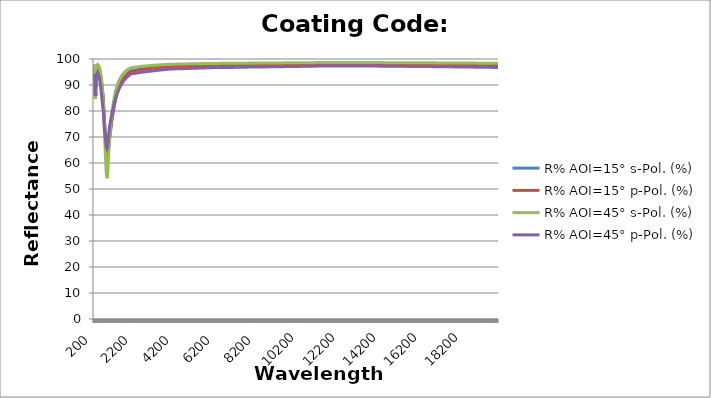
| Category | R% AOI=15° s-Pol. (%) | R% AOI=15° p-Pol. (%) | R% AOI=45° s-Pol. (%) | R% AOI=45° p-Pol. (%) |
|---|---|---|---|---|
| 200.0 | 96.196 | 95.695 | 97.964 | 94.34 |
| 210.0 | 96.264 | 95.821 | 97.534 | 93.773 |
| 220.0 | 95.829 | 95.392 | 96.652 | 92.587 |
| 230.0 | 94.94 | 94.49 | 95.05 | 90.907 |
| 240.0 | 93.361 | 92.903 | 92.083 | 88.772 |
| 250.0 | 90.886 | 90.485 | 87.526 | 86.776 |
| 260.0 | 86.806 | 86.65 | 84.808 | 85.833 |
| 270.0 | 84.898 | 84.804 | 89.276 | 87.025 |
| 280.0 | 87.232 | 86.816 | 93.231 | 89.119 |
| 290.0 | 90.482 | 89.896 | 95.323 | 90.965 |
| 300.0 | 92.911 | 92.334 | 96.475 | 92.358 |
| 310.0 | 94.393 | 93.874 | 97.102 | 93.277 |
| 320.0 | 95.338 | 94.875 | 97.481 | 93.9 |
| 330.0 | 95.946 | 95.529 | 97.712 | 94.307 |
| 340.0 | 96.342 | 95.958 | 97.853 | 94.567 |
| 350.0 | 96.577 | 96.215 | 97.918 | 94.69 |
| 360.0 | 96.728 | 96.38 | 97.944 | 94.744 |
| 370.0 | 96.817 | 96.48 | 97.939 | 94.738 |
| 380.0 | 96.858 | 96.527 | 97.908 | 94.68 |
| 390.0 | 96.836 | 96.504 | 97.838 | 94.538 |
| 400.0 | 96.784 | 96.449 | 97.748 | 94.36 |
| 410.0 | 96.715 | 96.377 | 97.648 | 94.168 |
| 420.0 | 96.623 | 96.28 | 97.53 | 93.948 |
| 430.0 | 96.51 | 96.159 | 97.392 | 93.7 |
| 440.0 | 96.344 | 95.982 | 97.212 | 93.371 |
| 450.0 | 96.111 | 95.732 | 96.973 | 92.934 |
| 460.0 | 95.873 | 95.478 | 96.727 | 92.501 |
| 470.0 | 95.616 | 95.203 | 96.457 | 92.048 |
| 480.0 | 95.338 | 94.907 | 96.162 | 91.574 |
| 490.0 | 95.046 | 94.598 | 95.849 | 91.096 |
| 500.0 | 94.685 | 94.215 | 95.467 | 90.517 |
| 510.0 | 94.291 | 93.798 | 95.048 | 89.906 |
| 520.0 | 93.871 | 93.355 | 94.591 | 89.278 |
| 530.0 | 93.422 | 92.885 | 94.095 | 88.634 |
| 540.0 | 92.944 | 92.386 | 93.556 | 87.979 |
| 550.0 | 92.404 | 91.824 | 92.941 | 87.264 |
| 560.0 | 91.783 | 91.178 | 92.225 | 86.464 |
| 570.0 | 91.127 | 90.502 | 91.452 | 85.662 |
| 580.0 | 90.436 | 89.793 | 90.618 | 84.863 |
| 590.0 | 89.71 | 89.052 | 89.719 | 84.071 |
| 600.0 | 88.948 | 88.282 | 88.755 | 83.29 |
| 610.0 | 88.146 | 87.474 | 87.711 | 82.519 |
| 620.0 | 87.309 | 86.639 | 86.598 | 81.769 |
| 630.0 | 86.44 | 85.779 | 85.416 | 81.044 |
| 640.0 | 85.543 | 84.898 | 84.168 | 80.348 |
| 650.0 | 84.62 | 83.999 | 82.859 | 79.686 |
| 660.0 | 83.246 | 82.637 | 81.052 | 78.472 |
| 670.0 | 81.808 | 81.222 | 79.142 | 77.259 |
| 680.0 | 80.313 | 79.759 | 77.138 | 76.052 |
| 690.0 | 78.767 | 78.255 | 75.053 | 74.856 |
| 700.0 | 77.177 | 76.716 | 72.904 | 73.674 |
| 710.0 | 75.745 | 75.351 | 70.93 | 72.738 |
| 720.0 | 74.303 | 73.983 | 68.953 | 71.833 |
| 730.0 | 72.859 | 72.62 | 66.996 | 70.962 |
| 740.0 | 71.424 | 71.272 | 65.084 | 70.126 |
| 750.0 | 70.006 | 69.947 | 63.238 | 69.326 |
| 760.0 | 68.618 | 68.654 | 61.486 | 68.564 |
| 770.0 | 67.265 | 67.398 | 59.84 | 67.838 |
| 780.0 | 65.957 | 66.186 | 58.32 | 67.151 |
| 790.0 | 64.701 | 65.024 | 56.937 | 66.501 |
| 800.0 | 63.503 | 63.917 | 55.702 | 65.888 |
| 810.0 | 62.805 | 63.3 | 55.107 | 65.712 |
| 820.0 | 62.173 | 62.742 | 54.654 | 65.564 |
| 830.0 | 61.608 | 62.243 | 54.34 | 65.441 |
| 840.0 | 61.111 | 61.805 | 54.159 | 65.343 |
| 850.0 | 60.682 | 61.425 | 54.103 | 65.268 |
| 860.0 | 61.326 | 62.1 | 55.333 | 66.17 |
| 870.0 | 62.033 | 62.827 | 56.66 | 67.068 |
| 880.0 | 62.796 | 63.598 | 58.062 | 67.959 |
| 890.0 | 63.608 | 64.407 | 59.518 | 68.84 |
| 900.0 | 64.462 | 65.249 | 61.009 | 69.709 |
| 910.0 | 65.336 | 66.103 | 62.489 | 70.553 |
| 920.0 | 66.234 | 66.975 | 63.97 | 71.381 |
| 930.0 | 67.151 | 67.859 | 65.438 | 72.193 |
| 940.0 | 68.08 | 68.75 | 66.885 | 72.986 |
| 950.0 | 69.015 | 69.645 | 68.3 | 73.762 |
| 960.0 | 69.62 | 70.213 | 69.315 | 74.231 |
| 970.0 | 70.237 | 70.791 | 70.312 | 74.696 |
| 980.0 | 70.861 | 71.375 | 71.288 | 75.155 |
| 990.0 | 71.49 | 71.963 | 72.239 | 75.609 |
| 1000.0 | 72.121 | 72.551 | 73.163 | 76.057 |
| 1010.0 | 72.751 | 73.139 | 74.059 | 76.498 |
| 1020.0 | 73.378 | 73.724 | 74.925 | 76.933 |
| 1030.0 | 73.999 | 74.304 | 75.761 | 77.36 |
| 1040.0 | 74.613 | 74.878 | 76.567 | 77.779 |
| 1050.0 | 75.219 | 75.445 | 77.342 | 78.191 |
| 1060.0 | 75.814 | 76.003 | 78.087 | 78.595 |
| 1070.0 | 76.399 | 76.552 | 78.803 | 78.991 |
| 1080.0 | 76.973 | 77.09 | 79.49 | 79.379 |
| 1090.0 | 77.534 | 77.618 | 80.148 | 79.759 |
| 1100.0 | 78.082 | 78.134 | 80.779 | 80.131 |
| 1110.0 | 78.617 | 78.639 | 81.384 | 80.495 |
| 1120.0 | 79.138 | 79.132 | 81.964 | 80.851 |
| 1130.0 | 79.646 | 79.613 | 82.519 | 81.199 |
| 1140.0 | 80.14 | 80.082 | 83.051 | 81.539 |
| 1150.0 | 80.62 | 80.539 | 83.56 | 81.871 |
| 1160.0 | 81.087 | 80.984 | 84.048 | 82.196 |
| 1170.0 | 81.54 | 81.416 | 84.515 | 82.513 |
| 1180.0 | 81.98 | 81.837 | 84.963 | 82.822 |
| 1190.0 | 82.407 | 82.246 | 85.392 | 83.125 |
| 1200.0 | 82.821 | 82.643 | 85.804 | 83.42 |
| 1210.0 | 83.223 | 83.029 | 86.198 | 83.709 |
| 1220.0 | 83.612 | 83.404 | 86.576 | 83.99 |
| 1230.0 | 83.989 | 83.768 | 86.939 | 84.265 |
| 1240.0 | 84.354 | 84.121 | 87.288 | 84.533 |
| 1250.0 | 84.709 | 84.464 | 87.622 | 84.795 |
| 1260.0 | 85.052 | 84.797 | 87.943 | 85.05 |
| 1270.0 | 85.384 | 85.12 | 88.252 | 85.3 |
| 1280.0 | 85.706 | 85.434 | 88.548 | 85.544 |
| 1290.0 | 86.019 | 85.738 | 88.833 | 85.781 |
| 1300.0 | 86.322 | 86.035 | 89.108 | 86.014 |
| 1310.0 | 86.616 | 86.322 | 89.373 | 86.242 |
| 1320.0 | 86.901 | 86.602 | 89.628 | 86.464 |
| 1330.0 | 87.177 | 86.872 | 89.873 | 86.68 |
| 1340.0 | 87.445 | 87.135 | 90.109 | 86.892 |
| 1350.0 | 87.704 | 87.391 | 90.337 | 87.098 |
| 1360.0 | 87.955 | 87.638 | 90.556 | 87.3 |
| 1370.0 | 88.199 | 87.879 | 90.768 | 87.497 |
| 1380.0 | 88.436 | 88.113 | 90.972 | 87.69 |
| 1390.0 | 88.665 | 88.34 | 91.169 | 87.878 |
| 1400.0 | 88.888 | 88.56 | 91.359 | 88.061 |
| 1410.0 | 89.104 | 88.774 | 91.543 | 88.241 |
| 1420.0 | 89.313 | 88.983 | 91.72 | 88.416 |
| 1430.0 | 89.516 | 89.185 | 91.892 | 88.588 |
| 1440.0 | 89.714 | 89.382 | 92.058 | 88.755 |
| 1450.0 | 89.906 | 89.573 | 92.218 | 88.919 |
| 1460.0 | 90.092 | 89.759 | 92.373 | 89.079 |
| 1470.0 | 90.273 | 89.94 | 92.523 | 89.236 |
| 1480.0 | 90.449 | 90.116 | 92.669 | 89.389 |
| 1490.0 | 90.62 | 90.287 | 92.81 | 89.539 |
| 1500.0 | 90.786 | 90.454 | 92.946 | 89.685 |
| 1510.0 | 90.947 | 90.615 | 93.078 | 89.828 |
| 1520.0 | 91.103 | 90.772 | 93.206 | 89.967 |
| 1530.0 | 91.255 | 90.925 | 93.33 | 90.104 |
| 1540.0 | 91.403 | 91.074 | 93.45 | 90.237 |
| 1550.0 | 91.547 | 91.219 | 93.566 | 90.368 |
| 1560.0 | 91.687 | 91.36 | 93.68 | 90.496 |
| 1570.0 | 91.824 | 91.498 | 93.79 | 90.622 |
| 1580.0 | 91.957 | 91.632 | 93.897 | 90.744 |
| 1590.0 | 92.086 | 91.763 | 94 | 90.865 |
| 1600.0 | 92.213 | 91.891 | 94.102 | 90.982 |
| 1610.0 | 92.336 | 92.016 | 94.2 | 91.098 |
| 1620.0 | 92.456 | 92.137 | 94.295 | 91.211 |
| 1630.0 | 92.573 | 92.256 | 94.388 | 91.322 |
| 1640.0 | 92.687 | 92.372 | 94.479 | 91.43 |
| 1650.0 | 92.798 | 92.485 | 94.567 | 91.537 |
| 1660.0 | 92.907 | 92.595 | 94.653 | 91.641 |
| 1670.0 | 93.012 | 92.703 | 94.736 | 91.744 |
| 1680.0 | 93.116 | 92.808 | 94.818 | 91.844 |
| 1690.0 | 93.217 | 92.911 | 94.897 | 91.942 |
| 1700.0 | 93.315 | 93.012 | 94.974 | 92.039 |
| 1710.0 | 93.412 | 93.11 | 95.05 | 92.134 |
| 1720.0 | 93.506 | 93.206 | 95.123 | 92.226 |
| 1730.0 | 93.597 | 93.299 | 95.195 | 92.318 |
| 1740.0 | 93.687 | 93.391 | 95.265 | 92.407 |
| 1750.0 | 93.775 | 93.481 | 95.333 | 92.495 |
| 1760.0 | 93.86 | 93.568 | 95.4 | 92.581 |
| 1770.0 | 93.944 | 93.654 | 95.465 | 92.665 |
| 1780.0 | 94.026 | 93.738 | 95.529 | 92.748 |
| 1790.0 | 94.106 | 93.82 | 95.591 | 92.83 |
| 1800.0 | 94.185 | 93.901 | 95.652 | 92.91 |
| 1810.0 | 94.261 | 93.979 | 95.711 | 92.988 |
| 1820.0 | 94.336 | 94.056 | 95.769 | 93.066 |
| 1830.0 | 94.41 | 94.132 | 95.825 | 93.142 |
| 1840.0 | 94.482 | 94.206 | 95.881 | 93.216 |
| 1850.0 | 94.552 | 94.278 | 95.935 | 93.289 |
| 1860.0 | 94.621 | 94.349 | 95.988 | 93.361 |
| 1870.0 | 94.688 | 94.418 | 96.04 | 93.432 |
| 1880.0 | 94.754 | 94.487 | 96.09 | 93.501 |
| 1890.0 | 94.819 | 94.553 | 96.14 | 93.57 |
| 1900.0 | 94.883 | 94.619 | 96.189 | 93.637 |
| 1910.0 | 94.945 | 94.683 | 96.236 | 93.702 |
| 1920.0 | 95.006 | 94.746 | 96.283 | 93.767 |
| 1930.0 | 95.065 | 94.807 | 96.328 | 93.831 |
| 1940.0 | 95.124 | 94.868 | 96.373 | 93.894 |
| 1950.0 | 95.181 | 94.927 | 96.417 | 93.956 |
| 1960.0 | 95.238 | 94.985 | 96.46 | 94.016 |
| 1970.0 | 95.293 | 95.042 | 96.502 | 94.076 |
| 1980.0 | 95.347 | 95.098 | 96.543 | 94.135 |
| 1990.0 | 95.4 | 95.153 | 96.584 | 94.193 |
| 2000.0 | 95.452 | 95.207 | 96.623 | 94.25 |
| 2010.0 | 95.469 | 95.224 | 96.636 | 94.262 |
| 2020.0 | 95.485 | 95.24 | 96.649 | 94.274 |
| 2030.0 | 95.501 | 95.256 | 96.662 | 94.287 |
| 2040.0 | 95.517 | 95.272 | 96.674 | 94.299 |
| 2050.0 | 95.533 | 95.288 | 96.687 | 94.312 |
| 2060.0 | 95.549 | 95.304 | 96.699 | 94.324 |
| 2070.0 | 95.565 | 95.32 | 96.711 | 94.336 |
| 2080.0 | 95.58 | 95.336 | 96.723 | 94.349 |
| 2090.0 | 95.596 | 95.351 | 96.735 | 94.361 |
| 2100.0 | 95.611 | 95.367 | 96.747 | 94.374 |
| 2110.0 | 95.626 | 95.382 | 96.759 | 94.386 |
| 2120.0 | 95.641 | 95.397 | 96.771 | 94.398 |
| 2130.0 | 95.656 | 95.412 | 96.782 | 94.41 |
| 2140.0 | 95.671 | 95.427 | 96.794 | 94.423 |
| 2150.0 | 95.686 | 95.442 | 96.805 | 94.435 |
| 2160.0 | 95.7 | 95.457 | 96.816 | 94.447 |
| 2170.0 | 95.715 | 95.471 | 96.827 | 94.46 |
| 2180.0 | 95.729 | 95.486 | 96.838 | 94.472 |
| 2190.0 | 95.743 | 95.5 | 96.849 | 94.484 |
| 2200.0 | 95.757 | 95.515 | 96.86 | 94.496 |
| 2210.0 | 95.771 | 95.529 | 96.871 | 94.508 |
| 2220.0 | 95.785 | 95.543 | 96.882 | 94.521 |
| 2230.0 | 95.799 | 95.557 | 96.892 | 94.533 |
| 2240.0 | 95.813 | 95.571 | 96.903 | 94.545 |
| 2250.0 | 95.826 | 95.585 | 96.913 | 94.557 |
| 2260.0 | 95.84 | 95.598 | 96.923 | 94.569 |
| 2270.0 | 95.853 | 95.612 | 96.934 | 94.581 |
| 2280.0 | 95.866 | 95.626 | 96.944 | 94.593 |
| 2290.0 | 95.879 | 95.639 | 96.954 | 94.605 |
| 2300.0 | 95.892 | 95.652 | 96.964 | 94.617 |
| 2310.0 | 95.906 | 95.666 | 96.974 | 94.629 |
| 2320.0 | 95.918 | 95.679 | 96.983 | 94.641 |
| 2330.0 | 95.931 | 95.692 | 96.993 | 94.653 |
| 2340.0 | 95.944 | 95.705 | 97.003 | 94.664 |
| 2350.0 | 95.956 | 95.718 | 97.012 | 94.676 |
| 2360.0 | 95.969 | 95.73 | 97.022 | 94.688 |
| 2370.0 | 95.981 | 95.743 | 97.031 | 94.7 |
| 2380.0 | 95.994 | 95.756 | 97.041 | 94.711 |
| 2390.0 | 96.006 | 95.768 | 97.05 | 94.723 |
| 2400.0 | 96.018 | 95.781 | 97.059 | 94.735 |
| 2410.0 | 96.03 | 95.793 | 97.068 | 94.746 |
| 2420.0 | 96.042 | 95.805 | 97.078 | 94.758 |
| 2430.0 | 96.054 | 95.818 | 97.086 | 94.769 |
| 2440.0 | 96.066 | 95.83 | 97.095 | 94.781 |
| 2450.0 | 96.078 | 95.842 | 97.104 | 94.792 |
| 2460.0 | 96.089 | 95.854 | 97.113 | 94.804 |
| 2470.0 | 96.101 | 95.866 | 97.122 | 94.815 |
| 2480.0 | 96.112 | 95.877 | 97.13 | 94.826 |
| 2490.0 | 96.124 | 95.889 | 97.139 | 94.838 |
| 2500.0 | 96.135 | 95.901 | 97.148 | 94.849 |
| 2510.0 | 96.146 | 95.912 | 97.156 | 94.86 |
| 2520.0 | 96.157 | 95.924 | 97.165 | 94.872 |
| 2530.0 | 96.168 | 95.935 | 97.173 | 94.883 |
| 2540.0 | 96.18 | 95.947 | 97.181 | 94.894 |
| 2550.0 | 96.19 | 95.958 | 97.19 | 94.905 |
| 2560.0 | 96.201 | 95.969 | 97.198 | 94.916 |
| 2570.0 | 96.212 | 95.98 | 97.206 | 94.927 |
| 2580.0 | 96.223 | 95.992 | 97.214 | 94.938 |
| 2590.0 | 96.234 | 96.002 | 97.222 | 94.949 |
| 2600.0 | 96.244 | 96.013 | 97.23 | 94.96 |
| 2610.0 | 96.255 | 96.024 | 97.238 | 94.971 |
| 2620.0 | 96.265 | 96.035 | 97.246 | 94.982 |
| 2630.0 | 96.276 | 96.046 | 97.254 | 94.992 |
| 2640.0 | 96.286 | 96.057 | 97.261 | 95.003 |
| 2650.0 | 96.296 | 96.067 | 97.269 | 95.014 |
| 2660.0 | 96.306 | 96.078 | 97.277 | 95.025 |
| 2670.0 | 96.316 | 96.088 | 97.284 | 95.035 |
| 2680.0 | 96.326 | 96.099 | 97.292 | 95.046 |
| 2690.0 | 96.337 | 96.109 | 97.3 | 95.057 |
| 2700.0 | 96.346 | 96.119 | 97.307 | 95.067 |
| 2710.0 | 96.356 | 96.13 | 97.314 | 95.078 |
| 2720.0 | 96.366 | 96.14 | 97.322 | 95.088 |
| 2730.0 | 96.376 | 96.15 | 97.329 | 95.099 |
| 2740.0 | 96.386 | 96.16 | 97.336 | 95.109 |
| 2750.0 | 96.395 | 96.17 | 97.344 | 95.119 |
| 2760.0 | 96.405 | 96.18 | 97.351 | 95.13 |
| 2770.0 | 96.414 | 96.19 | 97.358 | 95.14 |
| 2780.0 | 96.424 | 96.2 | 97.365 | 95.15 |
| 2790.0 | 96.433 | 96.21 | 97.372 | 95.161 |
| 2800.0 | 96.443 | 96.219 | 97.379 | 95.171 |
| 2810.0 | 96.452 | 96.229 | 97.386 | 95.181 |
| 2820.0 | 96.461 | 96.238 | 97.393 | 95.191 |
| 2830.0 | 96.47 | 96.248 | 97.4 | 95.201 |
| 2840.0 | 96.48 | 96.258 | 97.407 | 95.211 |
| 2850.0 | 96.489 | 96.267 | 97.413 | 95.221 |
| 2860.0 | 96.498 | 96.276 | 97.42 | 95.231 |
| 2870.0 | 96.507 | 96.286 | 97.427 | 95.241 |
| 2880.0 | 96.516 | 96.295 | 97.434 | 95.251 |
| 2890.0 | 96.525 | 96.304 | 97.44 | 95.261 |
| 2900.0 | 96.533 | 96.314 | 97.447 | 95.271 |
| 2910.0 | 96.542 | 96.323 | 97.453 | 95.28 |
| 2920.0 | 96.551 | 96.332 | 97.46 | 95.29 |
| 2930.0 | 96.56 | 96.341 | 97.466 | 95.3 |
| 2940.0 | 96.568 | 96.35 | 97.473 | 95.31 |
| 2950.0 | 96.577 | 96.359 | 97.479 | 95.319 |
| 2960.0 | 96.585 | 96.368 | 97.486 | 95.329 |
| 2970.0 | 96.594 | 96.376 | 97.492 | 95.339 |
| 2980.0 | 96.602 | 96.385 | 97.498 | 95.348 |
| 2990.0 | 96.611 | 96.394 | 97.504 | 95.358 |
| 3000.0 | 96.619 | 96.403 | 97.511 | 95.367 |
| 3010.0 | 96.627 | 96.412 | 97.517 | 95.377 |
| 3020.0 | 96.636 | 96.42 | 97.523 | 95.386 |
| 3030.0 | 96.644 | 96.429 | 97.529 | 95.395 |
| 3040.0 | 96.652 | 96.437 | 97.535 | 95.405 |
| 3050.0 | 96.66 | 96.446 | 97.541 | 95.414 |
| 3060.0 | 96.668 | 96.454 | 97.547 | 95.423 |
| 3070.0 | 96.676 | 96.462 | 97.553 | 95.433 |
| 3080.0 | 96.684 | 96.471 | 97.559 | 95.442 |
| 3090.0 | 96.692 | 96.479 | 97.565 | 95.451 |
| 3100.0 | 96.7 | 96.488 | 97.571 | 95.46 |
| 3110.0 | 96.708 | 96.496 | 97.577 | 95.469 |
| 3120.0 | 96.716 | 96.504 | 97.583 | 95.478 |
| 3130.0 | 96.724 | 96.512 | 97.588 | 95.487 |
| 3140.0 | 96.731 | 96.52 | 97.594 | 95.496 |
| 3150.0 | 96.739 | 96.528 | 97.6 | 95.505 |
| 3160.0 | 96.747 | 96.536 | 97.606 | 95.514 |
| 3170.0 | 96.754 | 96.544 | 97.611 | 95.523 |
| 3180.0 | 96.762 | 96.552 | 97.617 | 95.532 |
| 3190.0 | 96.769 | 96.56 | 97.623 | 95.541 |
| 3200.0 | 96.777 | 96.568 | 97.628 | 95.55 |
| 3210.0 | 96.784 | 96.576 | 97.634 | 95.559 |
| 3220.0 | 96.792 | 96.584 | 97.639 | 95.568 |
| 3230.0 | 96.799 | 96.591 | 97.645 | 95.576 |
| 3240.0 | 96.807 | 96.599 | 97.65 | 95.585 |
| 3250.0 | 96.814 | 96.607 | 97.656 | 95.594 |
| 3260.0 | 96.821 | 96.614 | 97.661 | 95.602 |
| 3270.0 | 96.828 | 96.622 | 97.666 | 95.611 |
| 3280.0 | 96.836 | 96.63 | 97.672 | 95.619 |
| 3290.0 | 96.843 | 96.637 | 97.677 | 95.628 |
| 3300.0 | 96.85 | 96.644 | 97.682 | 95.636 |
| 3310.0 | 96.857 | 96.652 | 97.688 | 95.645 |
| 3320.0 | 96.864 | 96.659 | 97.693 | 95.653 |
| 3330.0 | 96.871 | 96.667 | 97.698 | 95.662 |
| 3340.0 | 96.878 | 96.674 | 97.703 | 95.67 |
| 3350.0 | 96.885 | 96.681 | 97.709 | 95.679 |
| 3360.0 | 96.892 | 96.689 | 97.714 | 95.687 |
| 3370.0 | 96.899 | 96.696 | 97.719 | 95.695 |
| 3380.0 | 96.906 | 96.703 | 97.724 | 95.704 |
| 3390.0 | 96.913 | 96.71 | 97.729 | 95.712 |
| 3400.0 | 96.92 | 96.717 | 97.734 | 95.72 |
| 3410.0 | 96.926 | 96.725 | 97.739 | 95.728 |
| 3420.0 | 96.933 | 96.732 | 97.744 | 95.736 |
| 3430.0 | 96.94 | 96.739 | 97.749 | 95.744 |
| 3440.0 | 96.946 | 96.746 | 97.754 | 95.752 |
| 3450.0 | 96.953 | 96.753 | 97.759 | 95.761 |
| 3460.0 | 96.96 | 96.76 | 97.764 | 95.769 |
| 3470.0 | 96.966 | 96.766 | 97.769 | 95.777 |
| 3480.0 | 96.973 | 96.773 | 97.774 | 95.785 |
| 3490.0 | 96.979 | 96.78 | 97.778 | 95.793 |
| 3500.0 | 96.986 | 96.787 | 97.783 | 95.8 |
| 3510.0 | 96.992 | 96.794 | 97.788 | 95.808 |
| 3520.0 | 96.999 | 96.801 | 97.793 | 95.816 |
| 3530.0 | 97.005 | 96.807 | 97.798 | 95.824 |
| 3540.0 | 97.011 | 96.814 | 97.802 | 95.832 |
| 3550.0 | 97.018 | 96.821 | 97.807 | 95.84 |
| 3560.0 | 97.024 | 96.827 | 97.812 | 95.848 |
| 3570.0 | 97.03 | 96.834 | 97.816 | 95.855 |
| 3580.0 | 97.037 | 96.841 | 97.821 | 95.863 |
| 3590.0 | 97.043 | 96.847 | 97.826 | 95.871 |
| 3600.0 | 97.049 | 96.854 | 97.83 | 95.878 |
| 3610.0 | 97.055 | 96.86 | 97.835 | 95.886 |
| 3620.0 | 97.061 | 96.867 | 97.839 | 95.894 |
| 3630.0 | 97.068 | 96.873 | 97.844 | 95.901 |
| 3640.0 | 97.074 | 96.88 | 97.848 | 95.909 |
| 3650.0 | 97.08 | 96.886 | 97.853 | 95.916 |
| 3660.0 | 97.086 | 96.892 | 97.857 | 95.924 |
| 3670.0 | 97.092 | 96.899 | 97.862 | 95.931 |
| 3680.0 | 97.098 | 96.905 | 97.866 | 95.939 |
| 3690.0 | 97.104 | 96.911 | 97.87 | 95.946 |
| 3700.0 | 97.11 | 96.917 | 97.875 | 95.954 |
| 3710.0 | 97.116 | 96.924 | 97.879 | 95.961 |
| 3720.0 | 97.121 | 96.93 | 97.884 | 95.968 |
| 3730.0 | 97.127 | 96.936 | 97.888 | 95.976 |
| 3740.0 | 97.133 | 96.942 | 97.892 | 95.983 |
| 3750.0 | 97.139 | 96.948 | 97.896 | 95.99 |
| 3760.0 | 97.145 | 96.954 | 97.901 | 95.997 |
| 3770.0 | 97.15 | 96.96 | 97.905 | 96.004 |
| 3780.0 | 97.156 | 96.966 | 97.909 | 96.012 |
| 3790.0 | 97.162 | 96.972 | 97.914 | 96.019 |
| 3800.0 | 97.167 | 96.978 | 97.918 | 96.026 |
| 3810.0 | 97.173 | 96.984 | 97.922 | 96.033 |
| 3820.0 | 97.179 | 96.99 | 97.926 | 96.04 |
| 3830.0 | 97.184 | 96.996 | 97.93 | 96.047 |
| 3840.0 | 97.19 | 97.002 | 97.934 | 96.054 |
| 3850.0 | 97.196 | 97.008 | 97.938 | 96.061 |
| 3860.0 | 97.201 | 97.014 | 97.943 | 96.068 |
| 3870.0 | 97.206 | 97.02 | 97.947 | 96.075 |
| 3880.0 | 97.212 | 97.025 | 97.951 | 96.082 |
| 3890.0 | 97.218 | 97.031 | 97.955 | 96.089 |
| 3900.0 | 97.223 | 97.037 | 97.959 | 96.096 |
| 3910.0 | 97.228 | 97.043 | 97.963 | 96.103 |
| 3920.0 | 97.234 | 97.048 | 97.967 | 96.11 |
| 3930.0 | 97.239 | 97.054 | 97.971 | 96.117 |
| 3940.0 | 97.244 | 97.06 | 97.975 | 96.124 |
| 3950.0 | 97.25 | 97.065 | 97.979 | 96.13 |
| 3960.0 | 97.255 | 97.071 | 97.983 | 96.137 |
| 3970.0 | 97.26 | 97.076 | 97.986 | 96.144 |
| 3980.0 | 97.266 | 97.082 | 97.99 | 96.151 |
| 3990.0 | 97.271 | 97.088 | 97.994 | 96.157 |
| 4000.0 | 97.276 | 97.093 | 97.998 | 96.164 |
| 4010.0 | 97.278 | 97.095 | 98 | 96.166 |
| 4020.0 | 97.28 | 97.097 | 98.001 | 96.168 |
| 4030.0 | 97.282 | 97.099 | 98.002 | 96.17 |
| 4040.0 | 97.284 | 97.101 | 98.004 | 96.172 |
| 4050.0 | 97.286 | 97.103 | 98.005 | 96.174 |
| 4060.0 | 97.288 | 97.105 | 98.006 | 96.176 |
| 4070.0 | 97.289 | 97.107 | 98.008 | 96.178 |
| 4080.0 | 97.291 | 97.109 | 98.009 | 96.18 |
| 4090.0 | 97.293 | 97.111 | 98.011 | 96.182 |
| 4100.0 | 97.295 | 97.113 | 98.012 | 96.185 |
| 4110.0 | 97.297 | 97.115 | 98.014 | 96.187 |
| 4120.0 | 97.299 | 97.117 | 98.015 | 96.189 |
| 4130.0 | 97.301 | 97.119 | 98.017 | 96.191 |
| 4140.0 | 97.303 | 97.121 | 98.018 | 96.193 |
| 4150.0 | 97.305 | 97.123 | 98.02 | 96.196 |
| 4160.0 | 97.307 | 97.125 | 98.021 | 96.198 |
| 4170.0 | 97.309 | 97.127 | 98.022 | 96.2 |
| 4180.0 | 97.311 | 97.129 | 98.024 | 96.202 |
| 4190.0 | 97.313 | 97.132 | 98.025 | 96.204 |
| 4200.0 | 97.315 | 97.134 | 98.027 | 96.207 |
| 4210.0 | 97.317 | 97.136 | 98.028 | 96.209 |
| 4220.0 | 97.319 | 97.138 | 98.03 | 96.211 |
| 4230.0 | 97.321 | 97.14 | 98.031 | 96.214 |
| 4240.0 | 97.323 | 97.142 | 98.033 | 96.216 |
| 4250.0 | 97.325 | 97.144 | 98.034 | 96.218 |
| 4260.0 | 97.327 | 97.146 | 98.036 | 96.221 |
| 4270.0 | 97.329 | 97.148 | 98.037 | 96.223 |
| 4280.0 | 97.331 | 97.15 | 98.039 | 96.225 |
| 4290.0 | 97.333 | 97.153 | 98.04 | 96.228 |
| 4300.0 | 97.335 | 97.155 | 98.042 | 96.23 |
| 4310.0 | 97.337 | 97.157 | 98.043 | 96.232 |
| 4320.0 | 97.339 | 97.159 | 98.045 | 96.235 |
| 4330.0 | 97.341 | 97.161 | 98.046 | 96.237 |
| 4340.0 | 97.343 | 97.163 | 98.048 | 96.24 |
| 4350.0 | 97.346 | 97.166 | 98.049 | 96.242 |
| 4360.0 | 97.348 | 97.168 | 98.051 | 96.245 |
| 4370.0 | 97.35 | 97.17 | 98.052 | 96.247 |
| 4380.0 | 97.352 | 97.172 | 98.054 | 96.25 |
| 4390.0 | 97.354 | 97.174 | 98.056 | 96.252 |
| 4400.0 | 97.356 | 97.176 | 98.057 | 96.254 |
| 4410.0 | 97.358 | 97.179 | 98.059 | 96.257 |
| 4420.0 | 97.36 | 97.181 | 98.06 | 96.26 |
| 4430.0 | 97.362 | 97.183 | 98.062 | 96.262 |
| 4440.0 | 97.364 | 97.185 | 98.063 | 96.264 |
| 4450.0 | 97.366 | 97.188 | 98.065 | 96.267 |
| 4460.0 | 97.368 | 97.19 | 98.066 | 96.27 |
| 4470.0 | 97.37 | 97.192 | 98.068 | 96.272 |
| 4480.0 | 97.373 | 97.194 | 98.07 | 96.275 |
| 4490.0 | 97.375 | 97.196 | 98.071 | 96.277 |
| 4500.0 | 97.377 | 97.198 | 98.073 | 96.28 |
| 4510.0 | 97.379 | 97.201 | 98.074 | 96.282 |
| 4520.0 | 97.381 | 97.203 | 98.076 | 96.285 |
| 4530.0 | 97.383 | 97.205 | 98.077 | 96.287 |
| 4540.0 | 97.385 | 97.208 | 98.079 | 96.29 |
| 4550.0 | 97.388 | 97.21 | 98.08 | 96.293 |
| 4560.0 | 97.39 | 97.212 | 98.082 | 96.295 |
| 4570.0 | 97.392 | 97.214 | 98.084 | 96.298 |
| 4580.0 | 97.394 | 97.216 | 98.085 | 96.3 |
| 4590.0 | 97.396 | 97.219 | 98.087 | 96.303 |
| 4600.0 | 97.398 | 97.221 | 98.088 | 96.306 |
| 4610.0 | 97.4 | 97.223 | 98.09 | 96.308 |
| 4620.0 | 97.402 | 97.225 | 98.092 | 96.311 |
| 4630.0 | 97.404 | 97.228 | 98.093 | 96.314 |
| 4640.0 | 97.407 | 97.23 | 98.095 | 96.316 |
| 4650.0 | 97.409 | 97.232 | 98.096 | 96.319 |
| 4660.0 | 97.411 | 97.234 | 98.098 | 96.321 |
| 4670.0 | 97.413 | 97.237 | 98.099 | 96.324 |
| 4680.0 | 97.415 | 97.239 | 98.101 | 96.327 |
| 4690.0 | 97.417 | 97.241 | 98.102 | 96.329 |
| 4700.0 | 97.42 | 97.244 | 98.104 | 96.332 |
| 4710.0 | 97.422 | 97.246 | 98.106 | 96.335 |
| 4720.0 | 97.424 | 97.248 | 98.107 | 96.337 |
| 4730.0 | 97.426 | 97.25 | 98.109 | 96.34 |
| 4740.0 | 97.428 | 97.253 | 98.11 | 96.343 |
| 4750.0 | 97.43 | 97.255 | 98.112 | 96.346 |
| 4760.0 | 97.432 | 97.257 | 98.114 | 96.348 |
| 4770.0 | 97.435 | 97.259 | 98.115 | 96.351 |
| 4780.0 | 97.437 | 97.262 | 98.117 | 96.354 |
| 4790.0 | 97.439 | 97.264 | 98.118 | 96.356 |
| 4800.0 | 97.441 | 97.266 | 98.12 | 96.359 |
| 4810.0 | 97.443 | 97.268 | 98.122 | 96.362 |
| 4820.0 | 97.445 | 97.271 | 98.123 | 96.364 |
| 4830.0 | 97.448 | 97.273 | 98.125 | 96.367 |
| 4840.0 | 97.45 | 97.275 | 98.126 | 96.37 |
| 4850.0 | 97.452 | 97.278 | 98.128 | 96.373 |
| 4860.0 | 97.454 | 97.28 | 98.13 | 96.375 |
| 4870.0 | 97.456 | 97.282 | 98.131 | 96.378 |
| 4880.0 | 97.458 | 97.284 | 98.133 | 96.381 |
| 4890.0 | 97.461 | 97.287 | 98.134 | 96.384 |
| 4900.0 | 97.463 | 97.289 | 98.136 | 96.386 |
| 4910.0 | 97.465 | 97.291 | 98.138 | 96.389 |
| 4920.0 | 97.467 | 97.294 | 98.139 | 96.392 |
| 4930.0 | 97.469 | 97.296 | 98.141 | 96.395 |
| 4940.0 | 97.471 | 97.298 | 98.142 | 96.397 |
| 4950.0 | 97.474 | 97.3 | 98.144 | 96.4 |
| 4960.0 | 97.476 | 97.303 | 98.146 | 96.403 |
| 4970.0 | 97.478 | 97.305 | 98.147 | 96.406 |
| 4980.0 | 97.48 | 97.307 | 98.149 | 96.408 |
| 4990.0 | 97.482 | 97.31 | 98.15 | 96.411 |
| 5000.0 | 97.484 | 97.312 | 98.152 | 96.414 |
| 5010.0 | 97.486 | 97.314 | 98.154 | 96.417 |
| 5020.0 | 97.489 | 97.316 | 98.155 | 96.419 |
| 5030.0 | 97.491 | 97.319 | 98.157 | 96.422 |
| 5040.0 | 97.493 | 97.321 | 98.158 | 96.425 |
| 5050.0 | 97.495 | 97.323 | 98.16 | 96.428 |
| 5060.0 | 97.497 | 97.326 | 98.162 | 96.431 |
| 5070.0 | 97.5 | 97.328 | 98.163 | 96.433 |
| 5080.0 | 97.502 | 97.33 | 98.165 | 96.436 |
| 5090.0 | 97.504 | 97.332 | 98.166 | 96.439 |
| 5100.0 | 97.506 | 97.335 | 98.168 | 96.442 |
| 5110.0 | 97.508 | 97.337 | 98.17 | 96.444 |
| 5120.0 | 97.51 | 97.339 | 98.171 | 96.447 |
| 5130.0 | 97.512 | 97.342 | 98.173 | 96.45 |
| 5140.0 | 97.515 | 97.344 | 98.174 | 96.453 |
| 5150.0 | 97.517 | 97.346 | 98.176 | 96.456 |
| 5160.0 | 97.519 | 97.348 | 98.178 | 96.458 |
| 5170.0 | 97.521 | 97.351 | 98.179 | 96.461 |
| 5180.0 | 97.523 | 97.353 | 98.181 | 96.464 |
| 5190.0 | 97.525 | 97.355 | 98.182 | 96.467 |
| 5200.0 | 97.528 | 97.358 | 98.184 | 96.47 |
| 5210.0 | 97.53 | 97.36 | 98.185 | 96.472 |
| 5220.0 | 97.532 | 97.362 | 98.187 | 96.475 |
| 5230.0 | 97.534 | 97.364 | 98.189 | 96.478 |
| 5240.0 | 97.536 | 97.367 | 98.19 | 96.481 |
| 5250.0 | 97.538 | 97.369 | 98.192 | 96.484 |
| 5260.0 | 97.54 | 97.371 | 98.193 | 96.486 |
| 5270.0 | 97.543 | 97.374 | 98.195 | 96.489 |
| 5280.0 | 97.545 | 97.376 | 98.196 | 96.492 |
| 5290.0 | 97.547 | 97.378 | 98.198 | 96.495 |
| 5300.0 | 97.549 | 97.38 | 98.2 | 96.498 |
| 5310.0 | 97.551 | 97.383 | 98.201 | 96.5 |
| 5320.0 | 97.553 | 97.385 | 98.203 | 96.503 |
| 5330.0 | 97.556 | 97.387 | 98.204 | 96.506 |
| 5340.0 | 97.558 | 97.389 | 98.206 | 96.509 |
| 5350.0 | 97.56 | 97.392 | 98.208 | 96.512 |
| 5360.0 | 97.562 | 97.394 | 98.209 | 96.514 |
| 5370.0 | 97.564 | 97.396 | 98.211 | 96.517 |
| 5380.0 | 97.566 | 97.398 | 98.212 | 96.52 |
| 5390.0 | 97.568 | 97.401 | 98.214 | 96.523 |
| 5400.0 | 97.57 | 97.403 | 98.215 | 96.526 |
| 5410.0 | 97.573 | 97.405 | 98.217 | 96.528 |
| 5420.0 | 97.575 | 97.408 | 98.219 | 96.531 |
| 5430.0 | 97.577 | 97.41 | 98.22 | 96.534 |
| 5440.0 | 97.579 | 97.412 | 98.222 | 96.537 |
| 5450.0 | 97.581 | 97.414 | 98.223 | 96.54 |
| 5460.0 | 97.583 | 97.416 | 98.225 | 96.542 |
| 5470.0 | 97.585 | 97.419 | 98.226 | 96.545 |
| 5480.0 | 97.587 | 97.421 | 98.228 | 96.548 |
| 5490.0 | 97.59 | 97.423 | 98.23 | 96.551 |
| 5500.0 | 97.592 | 97.426 | 98.231 | 96.554 |
| 5510.0 | 97.594 | 97.428 | 98.233 | 96.556 |
| 5520.0 | 97.596 | 97.43 | 98.234 | 96.559 |
| 5530.0 | 97.598 | 97.432 | 98.236 | 96.562 |
| 5540.0 | 97.6 | 97.434 | 98.237 | 96.565 |
| 5550.0 | 97.602 | 97.437 | 98.239 | 96.568 |
| 5560.0 | 97.604 | 97.439 | 98.24 | 96.57 |
| 5570.0 | 97.606 | 97.441 | 98.242 | 96.573 |
| 5580.0 | 97.609 | 97.444 | 98.244 | 96.576 |
| 5590.0 | 97.611 | 97.446 | 98.245 | 96.579 |
| 5600.0 | 97.613 | 97.448 | 98.247 | 96.582 |
| 5610.0 | 97.615 | 97.45 | 98.248 | 96.584 |
| 5620.0 | 97.617 | 97.452 | 98.25 | 96.587 |
| 5630.0 | 97.619 | 97.455 | 98.251 | 96.59 |
| 5640.0 | 97.621 | 97.457 | 98.253 | 96.593 |
| 5650.0 | 97.623 | 97.459 | 98.254 | 96.596 |
| 5660.0 | 97.625 | 97.461 | 98.256 | 96.598 |
| 5670.0 | 97.628 | 97.464 | 98.258 | 96.601 |
| 5680.0 | 97.63 | 97.466 | 98.259 | 96.604 |
| 5690.0 | 97.632 | 97.468 | 98.261 | 96.607 |
| 5700.0 | 97.634 | 97.47 | 98.262 | 96.61 |
| 5710.0 | 97.636 | 97.472 | 98.264 | 96.612 |
| 5720.0 | 97.638 | 97.475 | 98.265 | 96.615 |
| 5730.0 | 97.64 | 97.477 | 98.267 | 96.618 |
| 5740.0 | 97.642 | 97.479 | 98.268 | 96.621 |
| 5750.0 | 97.644 | 97.481 | 98.27 | 96.623 |
| 5760.0 | 97.646 | 97.483 | 98.271 | 96.626 |
| 5770.0 | 97.648 | 97.486 | 98.273 | 96.629 |
| 5780.0 | 97.65 | 97.488 | 98.274 | 96.632 |
| 5790.0 | 97.652 | 97.49 | 98.276 | 96.634 |
| 5800.0 | 97.654 | 97.492 | 98.277 | 96.637 |
| 5810.0 | 97.657 | 97.494 | 98.279 | 96.64 |
| 5820.0 | 97.659 | 97.497 | 98.28 | 96.643 |
| 5830.0 | 97.661 | 97.499 | 98.282 | 96.646 |
| 5840.0 | 97.663 | 97.501 | 98.284 | 96.648 |
| 5850.0 | 97.665 | 97.503 | 98.285 | 96.651 |
| 5860.0 | 97.667 | 97.505 | 98.286 | 96.654 |
| 5870.0 | 97.669 | 97.508 | 98.288 | 96.657 |
| 5880.0 | 97.671 | 97.51 | 98.29 | 96.659 |
| 5890.0 | 97.673 | 97.512 | 98.291 | 96.662 |
| 5900.0 | 97.675 | 97.514 | 98.292 | 96.665 |
| 5910.0 | 97.677 | 97.516 | 98.294 | 96.668 |
| 5920.0 | 97.679 | 97.518 | 98.296 | 96.67 |
| 5930.0 | 97.681 | 97.52 | 98.297 | 96.673 |
| 5940.0 | 97.683 | 97.523 | 98.299 | 96.676 |
| 5950.0 | 97.685 | 97.525 | 98.3 | 96.679 |
| 5960.0 | 97.687 | 97.527 | 98.302 | 96.681 |
| 5970.0 | 97.689 | 97.529 | 98.303 | 96.684 |
| 5980.0 | 97.691 | 97.531 | 98.305 | 96.687 |
| 5990.0 | 97.693 | 97.534 | 98.306 | 96.69 |
| 6000.0 | 97.695 | 97.536 | 98.308 | 96.692 |
| 6010.0 | 97.696 | 97.536 | 98.308 | 96.692 |
| 6020.0 | 97.696 | 97.536 | 98.308 | 96.693 |
| 6030.0 | 97.696 | 97.536 | 98.308 | 96.693 |
| 6040.0 | 97.696 | 97.536 | 98.308 | 96.693 |
| 6050.0 | 97.696 | 97.537 | 98.308 | 96.693 |
| 6060.0 | 97.697 | 97.537 | 98.308 | 96.693 |
| 6070.0 | 97.697 | 97.537 | 98.309 | 96.694 |
| 6080.0 | 97.697 | 97.538 | 98.309 | 96.694 |
| 6090.0 | 97.698 | 97.538 | 98.309 | 96.694 |
| 6100.0 | 97.698 | 97.538 | 98.309 | 96.694 |
| 6110.0 | 97.698 | 97.538 | 98.31 | 96.694 |
| 6120.0 | 97.698 | 97.539 | 98.31 | 96.695 |
| 6130.0 | 97.699 | 97.539 | 98.31 | 96.695 |
| 6140.0 | 97.699 | 97.539 | 98.31 | 96.696 |
| 6150.0 | 97.699 | 97.54 | 98.31 | 96.696 |
| 6160.0 | 97.7 | 97.54 | 98.311 | 96.696 |
| 6170.0 | 97.7 | 97.54 | 98.311 | 96.696 |
| 6180.0 | 97.7 | 97.541 | 98.311 | 96.697 |
| 6190.0 | 97.701 | 97.541 | 98.312 | 96.697 |
| 6200.0 | 97.701 | 97.542 | 98.312 | 96.698 |
| 6210.0 | 97.702 | 97.542 | 98.312 | 96.698 |
| 6220.0 | 97.702 | 97.543 | 98.312 | 96.699 |
| 6230.0 | 97.703 | 97.543 | 98.313 | 96.699 |
| 6240.0 | 97.703 | 97.544 | 98.313 | 96.7 |
| 6250.0 | 97.704 | 97.544 | 98.314 | 96.7 |
| 6260.0 | 97.704 | 97.544 | 98.314 | 96.701 |
| 6270.0 | 97.704 | 97.545 | 98.314 | 96.701 |
| 6280.0 | 97.705 | 97.545 | 98.314 | 96.702 |
| 6290.0 | 97.705 | 97.546 | 98.315 | 96.702 |
| 6300.0 | 97.706 | 97.546 | 98.315 | 96.703 |
| 6310.0 | 97.706 | 97.547 | 98.316 | 96.703 |
| 6320.0 | 97.707 | 97.548 | 98.316 | 96.704 |
| 6330.0 | 97.707 | 97.548 | 98.316 | 96.705 |
| 6340.0 | 97.708 | 97.549 | 98.317 | 96.705 |
| 6350.0 | 97.708 | 97.549 | 98.317 | 96.706 |
| 6360.0 | 97.709 | 97.55 | 98.318 | 96.706 |
| 6370.0 | 97.71 | 97.55 | 98.318 | 96.707 |
| 6380.0 | 97.71 | 97.551 | 98.318 | 96.708 |
| 6390.0 | 97.711 | 97.552 | 98.319 | 96.708 |
| 6400.0 | 97.711 | 97.552 | 98.319 | 96.709 |
| 6410.0 | 97.712 | 97.553 | 98.32 | 96.71 |
| 6420.0 | 97.712 | 97.553 | 98.32 | 96.711 |
| 6430.0 | 97.713 | 97.554 | 98.32 | 96.711 |
| 6440.0 | 97.714 | 97.555 | 98.321 | 96.712 |
| 6450.0 | 97.714 | 97.555 | 98.321 | 96.713 |
| 6460.0 | 97.715 | 97.556 | 98.322 | 96.714 |
| 6470.0 | 97.716 | 97.557 | 98.322 | 96.714 |
| 6480.0 | 97.716 | 97.557 | 98.323 | 96.715 |
| 6490.0 | 97.717 | 97.558 | 98.323 | 96.716 |
| 6500.0 | 97.717 | 97.559 | 98.324 | 96.717 |
| 6510.0 | 97.718 | 97.559 | 98.324 | 96.718 |
| 6520.0 | 97.719 | 97.56 | 98.325 | 96.718 |
| 6530.0 | 97.719 | 97.561 | 98.325 | 96.719 |
| 6540.0 | 97.72 | 97.562 | 98.326 | 96.72 |
| 6550.0 | 97.721 | 97.562 | 98.326 | 96.721 |
| 6560.0 | 97.722 | 97.563 | 98.327 | 96.722 |
| 6570.0 | 97.722 | 97.564 | 98.327 | 96.723 |
| 6580.0 | 97.723 | 97.564 | 98.328 | 96.724 |
| 6590.0 | 97.724 | 97.565 | 98.328 | 96.725 |
| 6600.0 | 97.724 | 97.566 | 98.329 | 96.726 |
| 6610.0 | 97.725 | 97.567 | 98.329 | 96.726 |
| 6620.0 | 97.726 | 97.568 | 98.33 | 96.727 |
| 6630.0 | 97.727 | 97.568 | 98.33 | 96.728 |
| 6640.0 | 97.727 | 97.569 | 98.331 | 96.729 |
| 6650.0 | 97.728 | 97.57 | 98.332 | 96.73 |
| 6660.0 | 97.729 | 97.571 | 98.332 | 96.731 |
| 6670.0 | 97.73 | 97.572 | 98.333 | 96.732 |
| 6680.0 | 97.73 | 97.572 | 98.333 | 96.733 |
| 6690.0 | 97.731 | 97.573 | 98.334 | 96.734 |
| 6700.0 | 97.732 | 97.574 | 98.334 | 96.735 |
| 6710.0 | 97.733 | 97.575 | 98.335 | 96.736 |
| 6720.0 | 97.734 | 97.576 | 98.336 | 96.737 |
| 6730.0 | 97.734 | 97.576 | 98.336 | 96.738 |
| 6740.0 | 97.735 | 97.577 | 98.337 | 96.739 |
| 6750.0 | 97.736 | 97.578 | 98.337 | 96.74 |
| 6760.0 | 97.737 | 97.579 | 98.338 | 96.741 |
| 6770.0 | 97.738 | 97.58 | 98.339 | 96.742 |
| 6780.0 | 97.738 | 97.581 | 98.339 | 96.744 |
| 6790.0 | 97.739 | 97.582 | 98.34 | 96.745 |
| 6800.0 | 97.74 | 97.583 | 98.34 | 96.746 |
| 6810.0 | 97.741 | 97.584 | 98.341 | 96.747 |
| 6820.0 | 97.742 | 97.584 | 98.342 | 96.748 |
| 6830.0 | 97.743 | 97.585 | 98.342 | 96.749 |
| 6840.0 | 97.744 | 97.586 | 98.343 | 96.75 |
| 6850.0 | 97.744 | 97.587 | 98.344 | 96.751 |
| 6860.0 | 97.745 | 97.588 | 98.344 | 96.752 |
| 6870.0 | 97.746 | 97.589 | 98.345 | 96.754 |
| 6880.0 | 97.747 | 97.59 | 98.346 | 96.755 |
| 6890.0 | 97.748 | 97.591 | 98.346 | 96.756 |
| 6900.0 | 97.749 | 97.592 | 98.347 | 96.757 |
| 6910.0 | 97.75 | 97.593 | 98.348 | 96.758 |
| 6920.0 | 97.751 | 97.594 | 98.348 | 96.76 |
| 6930.0 | 97.752 | 97.595 | 98.349 | 96.761 |
| 6940.0 | 97.752 | 97.596 | 98.35 | 96.762 |
| 6950.0 | 97.753 | 97.597 | 98.35 | 96.763 |
| 6960.0 | 97.754 | 97.598 | 98.351 | 96.764 |
| 6970.0 | 97.755 | 97.599 | 98.352 | 96.766 |
| 6980.0 | 97.756 | 97.6 | 98.352 | 96.767 |
| 6990.0 | 97.757 | 97.6 | 98.353 | 96.768 |
| 7000.0 | 97.758 | 97.602 | 98.354 | 96.769 |
| 7010.0 | 97.759 | 97.602 | 98.354 | 96.77 |
| 7020.0 | 97.76 | 97.604 | 98.355 | 96.772 |
| 7030.0 | 97.761 | 97.604 | 98.356 | 96.773 |
| 7040.0 | 97.762 | 97.606 | 98.356 | 96.774 |
| 7050.0 | 97.763 | 97.607 | 98.357 | 96.776 |
| 7060.0 | 97.764 | 97.608 | 98.358 | 96.777 |
| 7070.0 | 97.765 | 97.609 | 98.358 | 96.778 |
| 7080.0 | 97.766 | 97.61 | 98.359 | 96.78 |
| 7090.0 | 97.766 | 97.611 | 98.36 | 96.781 |
| 7100.0 | 97.768 | 97.612 | 98.361 | 96.782 |
| 7110.0 | 97.768 | 97.613 | 98.361 | 96.783 |
| 7120.0 | 97.77 | 97.614 | 98.362 | 96.785 |
| 7130.0 | 97.77 | 97.615 | 98.363 | 96.786 |
| 7140.0 | 97.772 | 97.616 | 98.364 | 96.787 |
| 7150.0 | 97.772 | 97.617 | 98.364 | 96.789 |
| 7160.0 | 97.773 | 97.618 | 98.365 | 96.79 |
| 7170.0 | 97.774 | 97.619 | 98.366 | 96.791 |
| 7180.0 | 97.775 | 97.62 | 98.366 | 96.793 |
| 7190.0 | 97.776 | 97.621 | 98.367 | 96.794 |
| 7200.0 | 97.778 | 97.622 | 98.368 | 96.795 |
| 7210.0 | 97.778 | 97.623 | 98.369 | 96.797 |
| 7220.0 | 97.78 | 97.624 | 98.369 | 96.798 |
| 7230.0 | 97.78 | 97.626 | 98.37 | 96.8 |
| 7240.0 | 97.782 | 97.627 | 98.371 | 96.801 |
| 7250.0 | 97.783 | 97.628 | 98.372 | 96.802 |
| 7260.0 | 97.784 | 97.629 | 98.372 | 96.804 |
| 7270.0 | 97.785 | 97.63 | 98.373 | 96.805 |
| 7280.0 | 97.786 | 97.631 | 98.374 | 96.806 |
| 7290.0 | 97.787 | 97.632 | 98.375 | 96.808 |
| 7300.0 | 97.788 | 97.633 | 98.376 | 96.809 |
| 7310.0 | 97.789 | 97.634 | 98.376 | 96.811 |
| 7320.0 | 97.79 | 97.635 | 98.377 | 96.812 |
| 7330.0 | 97.791 | 97.636 | 98.378 | 96.814 |
| 7340.0 | 97.792 | 97.638 | 98.379 | 96.815 |
| 7350.0 | 97.793 | 97.639 | 98.379 | 96.816 |
| 7360.0 | 97.794 | 97.64 | 98.38 | 96.818 |
| 7370.0 | 97.795 | 97.641 | 98.381 | 96.819 |
| 7380.0 | 97.796 | 97.642 | 98.382 | 96.821 |
| 7390.0 | 97.797 | 97.643 | 98.382 | 96.822 |
| 7400.0 | 97.798 | 97.644 | 98.383 | 96.824 |
| 7410.0 | 97.799 | 97.646 | 98.384 | 96.825 |
| 7420.0 | 97.8 | 97.647 | 98.385 | 96.826 |
| 7430.0 | 97.802 | 97.648 | 98.386 | 96.828 |
| 7440.0 | 97.803 | 97.649 | 98.386 | 96.83 |
| 7450.0 | 97.804 | 97.65 | 98.387 | 96.831 |
| 7460.0 | 97.805 | 97.651 | 98.388 | 96.832 |
| 7470.0 | 97.806 | 97.652 | 98.389 | 96.834 |
| 7480.0 | 97.807 | 97.654 | 98.39 | 96.835 |
| 7490.0 | 97.808 | 97.655 | 98.39 | 96.837 |
| 7500.0 | 97.809 | 97.656 | 98.391 | 96.838 |
| 7510.0 | 97.81 | 97.657 | 98.392 | 96.84 |
| 7520.0 | 97.811 | 97.658 | 98.393 | 96.841 |
| 7530.0 | 97.812 | 97.659 | 98.394 | 96.843 |
| 7540.0 | 97.814 | 97.661 | 98.394 | 96.844 |
| 7550.0 | 97.815 | 97.662 | 98.395 | 96.846 |
| 7560.0 | 97.816 | 97.663 | 98.396 | 96.847 |
| 7570.0 | 97.817 | 97.664 | 98.397 | 96.849 |
| 7580.0 | 97.818 | 97.665 | 98.398 | 96.85 |
| 7590.0 | 97.819 | 97.666 | 98.399 | 96.852 |
| 7600.0 | 97.82 | 97.668 | 98.399 | 96.853 |
| 7610.0 | 97.821 | 97.669 | 98.4 | 96.855 |
| 7620.0 | 97.822 | 97.67 | 98.401 | 96.856 |
| 7630.0 | 97.824 | 97.671 | 98.402 | 96.858 |
| 7640.0 | 97.825 | 97.672 | 98.403 | 96.86 |
| 7650.0 | 97.826 | 97.674 | 98.404 | 96.861 |
| 7660.0 | 97.827 | 97.675 | 98.404 | 96.863 |
| 7670.0 | 97.828 | 97.676 | 98.405 | 96.864 |
| 7680.0 | 97.829 | 97.677 | 98.406 | 96.866 |
| 7690.0 | 97.83 | 97.678 | 98.407 | 96.867 |
| 7700.0 | 97.831 | 97.68 | 98.408 | 96.869 |
| 7710.0 | 97.833 | 97.681 | 98.408 | 96.87 |
| 7720.0 | 97.834 | 97.682 | 98.409 | 96.872 |
| 7730.0 | 97.835 | 97.683 | 98.41 | 96.874 |
| 7740.0 | 97.836 | 97.684 | 98.411 | 96.875 |
| 7750.0 | 97.837 | 97.686 | 98.412 | 96.877 |
| 7760.0 | 97.838 | 97.687 | 98.413 | 96.878 |
| 7770.0 | 97.839 | 97.688 | 98.414 | 96.88 |
| 7780.0 | 97.84 | 97.689 | 98.414 | 96.881 |
| 7790.0 | 97.842 | 97.691 | 98.415 | 96.883 |
| 7800.0 | 97.843 | 97.692 | 98.416 | 96.885 |
| 7810.0 | 97.844 | 97.693 | 98.417 | 96.886 |
| 7820.0 | 97.845 | 97.694 | 98.418 | 96.888 |
| 7830.0 | 97.846 | 97.696 | 98.419 | 96.889 |
| 7840.0 | 97.847 | 97.697 | 98.42 | 96.891 |
| 7850.0 | 97.849 | 97.698 | 98.42 | 96.892 |
| 7860.0 | 97.85 | 97.699 | 98.421 | 96.894 |
| 7870.0 | 97.851 | 97.7 | 98.422 | 96.896 |
| 7880.0 | 97.852 | 97.702 | 98.423 | 96.897 |
| 7890.0 | 97.853 | 97.703 | 98.424 | 96.899 |
| 7900.0 | 97.854 | 97.704 | 98.425 | 96.9 |
| 7910.0 | 97.856 | 97.705 | 98.426 | 96.902 |
| 7920.0 | 97.857 | 97.707 | 98.426 | 96.904 |
| 7930.0 | 97.858 | 97.708 | 98.427 | 96.905 |
| 7940.0 | 97.859 | 97.709 | 98.428 | 96.907 |
| 7950.0 | 97.86 | 97.71 | 98.429 | 96.909 |
| 7960.0 | 97.861 | 97.712 | 98.43 | 96.91 |
| 7970.0 | 97.863 | 97.713 | 98.431 | 96.912 |
| 7980.0 | 97.864 | 97.714 | 98.432 | 96.913 |
| 7990.0 | 97.865 | 97.715 | 98.432 | 96.915 |
| 8000.0 | 97.866 | 97.717 | 98.433 | 96.917 |
| 8010.0 | 97.867 | 97.717 | 98.434 | 96.917 |
| 8020.0 | 97.867 | 97.718 | 98.434 | 96.918 |
| 8030.0 | 97.868 | 97.718 | 98.434 | 96.919 |
| 8040.0 | 97.868 | 97.719 | 98.435 | 96.919 |
| 8050.0 | 97.868 | 97.719 | 98.435 | 96.92 |
| 8060.0 | 97.869 | 97.72 | 98.435 | 96.92 |
| 8070.0 | 97.87 | 97.72 | 98.436 | 96.921 |
| 8080.0 | 97.87 | 97.721 | 98.436 | 96.922 |
| 8090.0 | 97.87 | 97.721 | 98.436 | 96.922 |
| 8100.0 | 97.871 | 97.722 | 98.437 | 96.923 |
| 8110.0 | 97.872 | 97.722 | 98.437 | 96.924 |
| 8120.0 | 97.872 | 97.723 | 98.438 | 96.925 |
| 8130.0 | 97.873 | 97.724 | 98.438 | 96.925 |
| 8140.0 | 97.873 | 97.724 | 98.438 | 96.926 |
| 8150.0 | 97.874 | 97.725 | 98.439 | 96.927 |
| 8160.0 | 97.874 | 97.725 | 98.439 | 96.927 |
| 8170.0 | 97.875 | 97.726 | 98.44 | 96.928 |
| 8180.0 | 97.875 | 97.726 | 98.44 | 96.929 |
| 8190.0 | 97.876 | 97.727 | 98.44 | 96.93 |
| 8200.0 | 97.876 | 97.728 | 98.441 | 96.93 |
| 8210.0 | 97.877 | 97.728 | 98.441 | 96.931 |
| 8220.0 | 97.878 | 97.729 | 98.442 | 96.932 |
| 8230.0 | 97.878 | 97.729 | 98.442 | 96.933 |
| 8240.0 | 97.879 | 97.73 | 98.442 | 96.933 |
| 8250.0 | 97.879 | 97.73 | 98.443 | 96.934 |
| 8260.0 | 97.88 | 97.731 | 98.443 | 96.935 |
| 8270.0 | 97.88 | 97.732 | 98.444 | 96.936 |
| 8280.0 | 97.881 | 97.732 | 98.444 | 96.936 |
| 8290.0 | 97.882 | 97.733 | 98.445 | 96.937 |
| 8300.0 | 97.882 | 97.734 | 98.445 | 96.938 |
| 8310.0 | 97.883 | 97.734 | 98.446 | 96.939 |
| 8320.0 | 97.883 | 97.735 | 98.446 | 96.94 |
| 8330.0 | 97.884 | 97.736 | 98.446 | 96.94 |
| 8340.0 | 97.885 | 97.736 | 98.447 | 96.941 |
| 8350.0 | 97.885 | 97.737 | 98.447 | 96.942 |
| 8360.0 | 97.886 | 97.738 | 98.448 | 96.943 |
| 8370.0 | 97.886 | 97.738 | 98.448 | 96.944 |
| 8380.0 | 97.887 | 97.739 | 98.449 | 96.945 |
| 8390.0 | 97.888 | 97.74 | 98.449 | 96.946 |
| 8400.0 | 97.888 | 97.74 | 98.45 | 96.946 |
| 8410.0 | 97.889 | 97.741 | 98.45 | 96.947 |
| 8420.0 | 97.89 | 97.742 | 98.45 | 96.948 |
| 8430.0 | 97.89 | 97.742 | 98.451 | 96.949 |
| 8440.0 | 97.891 | 97.743 | 98.451 | 96.95 |
| 8450.0 | 97.892 | 97.744 | 98.452 | 96.951 |
| 8460.0 | 97.892 | 97.744 | 98.452 | 96.952 |
| 8470.0 | 97.893 | 97.745 | 98.453 | 96.952 |
| 8480.0 | 97.894 | 97.746 | 98.453 | 96.953 |
| 8490.0 | 97.894 | 97.746 | 98.454 | 96.954 |
| 8500.0 | 97.895 | 97.747 | 98.454 | 96.955 |
| 8510.0 | 97.896 | 97.748 | 98.455 | 96.956 |
| 8520.0 | 97.896 | 97.748 | 98.455 | 96.957 |
| 8530.0 | 97.897 | 97.749 | 98.456 | 96.958 |
| 8540.0 | 97.898 | 97.75 | 98.456 | 96.959 |
| 8550.0 | 97.898 | 97.751 | 98.457 | 96.96 |
| 8560.0 | 97.899 | 97.751 | 98.457 | 96.961 |
| 8570.0 | 97.9 | 97.752 | 98.458 | 96.962 |
| 8580.0 | 97.9 | 97.753 | 98.458 | 96.962 |
| 8590.0 | 97.901 | 97.754 | 98.459 | 96.963 |
| 8600.0 | 97.902 | 97.754 | 98.459 | 96.964 |
| 8610.0 | 97.902 | 97.755 | 98.46 | 96.965 |
| 8620.0 | 97.903 | 97.756 | 98.46 | 96.966 |
| 8630.0 | 97.904 | 97.756 | 98.461 | 96.967 |
| 8640.0 | 97.904 | 97.757 | 98.461 | 96.968 |
| 8650.0 | 97.905 | 97.758 | 98.462 | 96.969 |
| 8660.0 | 97.906 | 97.759 | 98.462 | 96.97 |
| 8670.0 | 97.906 | 97.76 | 98.463 | 96.971 |
| 8680.0 | 97.907 | 97.76 | 98.464 | 96.972 |
| 8690.0 | 97.908 | 97.761 | 98.464 | 96.973 |
| 8700.0 | 97.909 | 97.762 | 98.464 | 96.974 |
| 8710.0 | 97.909 | 97.762 | 98.465 | 96.975 |
| 8720.0 | 97.91 | 97.763 | 98.466 | 96.976 |
| 8730.0 | 97.911 | 97.764 | 98.466 | 96.977 |
| 8740.0 | 97.912 | 97.765 | 98.467 | 96.978 |
| 8750.0 | 97.912 | 97.766 | 98.467 | 96.979 |
| 8760.0 | 97.913 | 97.766 | 98.468 | 96.98 |
| 8770.0 | 97.914 | 97.767 | 98.468 | 96.981 |
| 8780.0 | 97.914 | 97.768 | 98.469 | 96.982 |
| 8790.0 | 97.915 | 97.769 | 98.469 | 96.983 |
| 8800.0 | 97.916 | 97.77 | 98.47 | 96.984 |
| 8810.0 | 97.917 | 97.77 | 98.47 | 96.985 |
| 8820.0 | 97.917 | 97.771 | 98.471 | 96.986 |
| 8830.0 | 97.918 | 97.772 | 98.472 | 96.987 |
| 8840.0 | 97.919 | 97.773 | 98.472 | 96.988 |
| 8850.0 | 97.92 | 97.774 | 98.473 | 96.989 |
| 8860.0 | 97.92 | 97.774 | 98.473 | 96.99 |
| 8870.0 | 97.921 | 97.775 | 98.474 | 96.991 |
| 8880.0 | 97.922 | 97.776 | 98.474 | 96.992 |
| 8890.0 | 97.923 | 97.777 | 98.475 | 96.993 |
| 8900.0 | 97.923 | 97.778 | 98.475 | 96.994 |
| 8910.0 | 97.924 | 97.778 | 98.476 | 96.996 |
| 8920.0 | 97.925 | 97.779 | 98.477 | 96.997 |
| 8930.0 | 97.926 | 97.78 | 98.477 | 96.998 |
| 8940.0 | 97.926 | 97.781 | 98.478 | 96.999 |
| 8950.0 | 97.927 | 97.782 | 98.478 | 97 |
| 8960.0 | 97.928 | 97.782 | 98.479 | 97.001 |
| 8970.0 | 97.929 | 97.783 | 98.479 | 97.002 |
| 8980.0 | 97.93 | 97.784 | 98.48 | 97.003 |
| 8990.0 | 97.93 | 97.785 | 98.48 | 97.004 |
| 9000.0 | 97.931 | 97.786 | 98.481 | 97.005 |
| 9010.0 | 97.932 | 97.787 | 98.482 | 97.006 |
| 9020.0 | 97.933 | 97.788 | 98.482 | 97.007 |
| 9030.0 | 97.934 | 97.788 | 98.483 | 97.008 |
| 9040.0 | 97.934 | 97.789 | 98.483 | 97.01 |
| 9050.0 | 97.935 | 97.79 | 98.484 | 97.011 |
| 9060.0 | 97.936 | 97.791 | 98.485 | 97.012 |
| 9070.0 | 97.937 | 97.792 | 98.485 | 97.013 |
| 9080.0 | 97.938 | 97.792 | 98.486 | 97.014 |
| 9090.0 | 97.938 | 97.793 | 98.486 | 97.015 |
| 9100.0 | 97.939 | 97.794 | 98.487 | 97.016 |
| 9110.0 | 97.94 | 97.795 | 98.488 | 97.017 |
| 9120.0 | 97.941 | 97.796 | 98.488 | 97.018 |
| 9130.0 | 97.942 | 97.797 | 98.489 | 97.02 |
| 9140.0 | 97.942 | 97.798 | 98.489 | 97.021 |
| 9150.0 | 97.943 | 97.798 | 98.49 | 97.022 |
| 9160.0 | 97.944 | 97.799 | 98.49 | 97.023 |
| 9170.0 | 97.945 | 97.8 | 98.491 | 97.024 |
| 9180.0 | 97.946 | 97.801 | 98.492 | 97.025 |
| 9190.0 | 97.946 | 97.802 | 98.492 | 97.026 |
| 9200.0 | 97.947 | 97.803 | 98.493 | 97.028 |
| 9210.0 | 97.948 | 97.804 | 98.494 | 97.029 |
| 9220.0 | 97.949 | 97.805 | 98.494 | 97.03 |
| 9230.0 | 97.95 | 97.806 | 98.495 | 97.031 |
| 9240.0 | 97.95 | 97.806 | 98.495 | 97.032 |
| 9250.0 | 97.951 | 97.807 | 98.496 | 97.033 |
| 9260.0 | 97.952 | 97.808 | 98.497 | 97.034 |
| 9270.0 | 97.953 | 97.809 | 98.497 | 97.036 |
| 9280.0 | 97.954 | 97.81 | 98.498 | 97.037 |
| 9290.0 | 97.955 | 97.811 | 98.498 | 97.038 |
| 9300.0 | 97.956 | 97.812 | 98.499 | 97.039 |
| 9310.0 | 97.956 | 97.813 | 98.5 | 97.04 |
| 9320.0 | 97.957 | 97.814 | 98.5 | 97.041 |
| 9330.0 | 97.958 | 97.814 | 98.501 | 97.042 |
| 9340.0 | 97.959 | 97.815 | 98.502 | 97.044 |
| 9350.0 | 97.96 | 97.816 | 98.502 | 97.045 |
| 9360.0 | 97.96 | 97.817 | 98.503 | 97.046 |
| 9370.0 | 97.961 | 97.818 | 98.503 | 97.047 |
| 9380.0 | 97.962 | 97.819 | 98.504 | 97.048 |
| 9390.0 | 97.963 | 97.82 | 98.505 | 97.05 |
| 9400.0 | 97.964 | 97.821 | 98.505 | 97.051 |
| 9410.0 | 97.965 | 97.822 | 98.506 | 97.052 |
| 9420.0 | 97.966 | 97.822 | 98.506 | 97.053 |
| 9430.0 | 97.966 | 97.823 | 98.507 | 97.054 |
| 9440.0 | 97.967 | 97.824 | 98.508 | 97.056 |
| 9450.0 | 97.968 | 97.825 | 98.508 | 97.057 |
| 9460.0 | 97.969 | 97.826 | 98.509 | 97.058 |
| 9470.0 | 97.97 | 97.827 | 98.51 | 97.059 |
| 9480.0 | 97.971 | 97.828 | 98.51 | 97.06 |
| 9490.0 | 97.972 | 97.829 | 98.511 | 97.062 |
| 9500.0 | 97.972 | 97.83 | 98.512 | 97.063 |
| 9510.0 | 97.973 | 97.831 | 98.512 | 97.064 |
| 9520.0 | 97.974 | 97.832 | 98.513 | 97.065 |
| 9530.0 | 97.975 | 97.832 | 98.513 | 97.066 |
| 9540.0 | 97.976 | 97.833 | 98.514 | 97.068 |
| 9550.0 | 97.977 | 97.834 | 98.515 | 97.069 |
| 9560.0 | 97.978 | 97.835 | 98.515 | 97.07 |
| 9570.0 | 97.978 | 97.836 | 98.516 | 97.071 |
| 9580.0 | 97.979 | 97.837 | 98.516 | 97.072 |
| 9590.0 | 97.98 | 97.838 | 98.517 | 97.074 |
| 9600.0 | 97.981 | 97.839 | 98.518 | 97.075 |
| 9610.0 | 97.982 | 97.84 | 98.518 | 97.076 |
| 9620.0 | 97.983 | 97.841 | 98.519 | 97.077 |
| 9630.0 | 97.984 | 97.842 | 98.52 | 97.078 |
| 9640.0 | 97.984 | 97.843 | 98.52 | 97.08 |
| 9650.0 | 97.985 | 97.844 | 98.521 | 97.081 |
| 9660.0 | 97.986 | 97.844 | 98.522 | 97.082 |
| 9670.0 | 97.987 | 97.845 | 98.522 | 97.083 |
| 9680.0 | 97.988 | 97.846 | 98.523 | 97.084 |
| 9690.0 | 97.989 | 97.847 | 98.524 | 97.086 |
| 9700.0 | 97.99 | 97.848 | 98.524 | 97.087 |
| 9710.0 | 97.991 | 97.849 | 98.525 | 97.088 |
| 9720.0 | 97.992 | 97.85 | 98.526 | 97.09 |
| 9730.0 | 97.992 | 97.851 | 98.526 | 97.091 |
| 9740.0 | 97.993 | 97.852 | 98.527 | 97.092 |
| 9750.0 | 97.994 | 97.853 | 98.528 | 97.093 |
| 9760.0 | 97.995 | 97.854 | 98.528 | 97.094 |
| 9770.0 | 97.996 | 97.855 | 98.529 | 97.096 |
| 9780.0 | 97.997 | 97.856 | 98.529 | 97.097 |
| 9790.0 | 97.998 | 97.857 | 98.53 | 97.098 |
| 9800.0 | 97.999 | 97.858 | 98.531 | 97.099 |
| 9810.0 | 98 | 97.859 | 98.531 | 97.101 |
| 9820.0 | 98 | 97.86 | 98.532 | 97.102 |
| 9830.0 | 98.001 | 97.86 | 98.533 | 97.103 |
| 9840.0 | 98.002 | 97.862 | 98.533 | 97.104 |
| 9850.0 | 98.003 | 97.862 | 98.534 | 97.106 |
| 9860.0 | 98.004 | 97.863 | 98.535 | 97.107 |
| 9870.0 | 98.005 | 97.864 | 98.535 | 97.108 |
| 9880.0 | 98.006 | 97.865 | 98.536 | 97.109 |
| 9890.0 | 98.007 | 97.866 | 98.537 | 97.111 |
| 9900.0 | 98.008 | 97.867 | 98.537 | 97.112 |
| 9910.0 | 98.008 | 97.868 | 98.538 | 97.113 |
| 9920.0 | 98.009 | 97.869 | 98.539 | 97.114 |
| 9930.0 | 98.01 | 97.87 | 98.539 | 97.116 |
| 9940.0 | 98.011 | 97.871 | 98.54 | 97.117 |
| 9950.0 | 98.012 | 97.872 | 98.541 | 97.118 |
| 9960.0 | 98.013 | 97.873 | 98.541 | 97.12 |
| 9970.0 | 98.014 | 97.874 | 98.542 | 97.121 |
| 9980.0 | 98.015 | 97.875 | 98.543 | 97.122 |
| 9990.0 | 98.016 | 97.876 | 98.543 | 97.123 |
| 10000.0 | 98.016 | 97.877 | 98.544 | 97.125 |
| 10010.0 | 98.017 | 97.878 | 98.544 | 97.126 |
| 10020.0 | 98.018 | 97.878 | 98.545 | 97.127 |
| 10030.0 | 98.019 | 97.879 | 98.546 | 97.128 |
| 10040.0 | 98.02 | 97.88 | 98.546 | 97.129 |
| 10050.0 | 98.02 | 97.881 | 98.547 | 97.13 |
| 10060.0 | 98.021 | 97.882 | 98.547 | 97.131 |
| 10070.0 | 98.022 | 97.883 | 98.548 | 97.132 |
| 10080.0 | 98.023 | 97.884 | 98.549 | 97.134 |
| 10090.0 | 98.024 | 97.884 | 98.549 | 97.135 |
| 10100.0 | 98.024 | 97.885 | 98.55 | 97.136 |
| 10110.0 | 98.025 | 97.886 | 98.55 | 97.137 |
| 10120.0 | 98.026 | 97.887 | 98.551 | 97.138 |
| 10130.0 | 98.027 | 97.888 | 98.552 | 97.139 |
| 10140.0 | 98.028 | 97.889 | 98.552 | 97.14 |
| 10150.0 | 98.028 | 97.89 | 98.553 | 97.142 |
| 10160.0 | 98.029 | 97.89 | 98.553 | 97.143 |
| 10170.0 | 98.03 | 97.891 | 98.554 | 97.144 |
| 10180.0 | 98.031 | 97.892 | 98.555 | 97.145 |
| 10190.0 | 98.032 | 97.893 | 98.555 | 97.146 |
| 10200.0 | 98.033 | 97.894 | 98.556 | 97.147 |
| 10210.0 | 98.033 | 97.895 | 98.556 | 97.148 |
| 10220.0 | 98.034 | 97.896 | 98.557 | 97.15 |
| 10230.0 | 98.035 | 97.896 | 98.558 | 97.151 |
| 10240.0 | 98.036 | 97.897 | 98.558 | 97.152 |
| 10250.0 | 98.037 | 97.898 | 98.559 | 97.153 |
| 10260.0 | 98.037 | 97.899 | 98.559 | 97.154 |
| 10270.0 | 98.038 | 97.9 | 98.56 | 97.155 |
| 10280.0 | 98.039 | 97.901 | 98.56 | 97.156 |
| 10290.0 | 98.04 | 97.902 | 98.561 | 97.158 |
| 10300.0 | 98.041 | 97.903 | 98.562 | 97.159 |
| 10310.0 | 98.042 | 97.904 | 98.562 | 97.16 |
| 10320.0 | 98.042 | 97.904 | 98.563 | 97.161 |
| 10330.0 | 98.043 | 97.905 | 98.564 | 97.162 |
| 10340.0 | 98.044 | 97.906 | 98.564 | 97.163 |
| 10350.0 | 98.045 | 97.907 | 98.565 | 97.164 |
| 10360.0 | 98.046 | 97.908 | 98.565 | 97.166 |
| 10370.0 | 98.046 | 97.909 | 98.566 | 97.167 |
| 10380.0 | 98.047 | 97.91 | 98.566 | 97.168 |
| 10390.0 | 98.048 | 97.91 | 98.567 | 97.169 |
| 10400.0 | 98.049 | 97.911 | 98.568 | 97.17 |
| 10410.0 | 98.05 | 97.912 | 98.568 | 97.171 |
| 10420.0 | 98.05 | 97.913 | 98.569 | 97.172 |
| 10430.0 | 98.051 | 97.914 | 98.57 | 97.174 |
| 10440.0 | 98.052 | 97.915 | 98.57 | 97.175 |
| 10450.0 | 98.053 | 97.916 | 98.571 | 97.176 |
| 10460.0 | 98.054 | 97.916 | 98.571 | 97.177 |
| 10470.0 | 98.054 | 97.917 | 98.572 | 97.178 |
| 10480.0 | 98.055 | 97.918 | 98.572 | 97.179 |
| 10490.0 | 98.056 | 97.919 | 98.573 | 97.18 |
| 10500.0 | 98.057 | 97.92 | 98.574 | 97.182 |
| 10510.0 | 98.058 | 97.921 | 98.574 | 97.183 |
| 10520.0 | 98.059 | 97.922 | 98.575 | 97.184 |
| 10530.0 | 98.059 | 97.923 | 98.576 | 97.185 |
| 10540.0 | 98.06 | 97.923 | 98.576 | 97.186 |
| 10550.0 | 98.061 | 97.924 | 98.577 | 97.188 |
| 10560.0 | 98.062 | 97.925 | 98.577 | 97.189 |
| 10570.0 | 98.063 | 97.926 | 98.578 | 97.19 |
| 10580.0 | 98.064 | 97.927 | 98.578 | 97.191 |
| 10590.0 | 98.064 | 97.928 | 98.579 | 97.192 |
| 10600.0 | 98.065 | 97.929 | 98.58 | 97.193 |
| 10610.0 | 98.066 | 97.93 | 98.58 | 97.194 |
| 10620.0 | 98.067 | 97.93 | 98.581 | 97.196 |
| 10630.0 | 98.068 | 97.931 | 98.582 | 97.197 |
| 10640.0 | 98.068 | 97.932 | 98.582 | 97.198 |
| 10650.0 | 98.069 | 97.933 | 98.583 | 97.199 |
| 10660.0 | 98.07 | 97.934 | 98.583 | 97.2 |
| 10670.0 | 98.071 | 97.935 | 98.584 | 97.201 |
| 10680.0 | 98.072 | 97.936 | 98.584 | 97.202 |
| 10690.0 | 98.072 | 97.936 | 98.585 | 97.204 |
| 10700.0 | 98.073 | 97.937 | 98.586 | 97.205 |
| 10710.0 | 98.074 | 97.938 | 98.586 | 97.206 |
| 10720.0 | 98.075 | 97.939 | 98.587 | 97.207 |
| 10730.0 | 98.076 | 97.94 | 98.588 | 97.208 |
| 10740.0 | 98.077 | 97.941 | 98.588 | 97.209 |
| 10750.0 | 98.077 | 97.942 | 98.589 | 97.211 |
| 10760.0 | 98.078 | 97.943 | 98.589 | 97.212 |
| 10770.0 | 98.079 | 97.944 | 98.59 | 97.213 |
| 10780.0 | 98.08 | 97.944 | 98.59 | 97.214 |
| 10790.0 | 98.081 | 97.945 | 98.591 | 97.215 |
| 10800.0 | 98.082 | 97.946 | 98.592 | 97.216 |
| 10810.0 | 98.082 | 97.947 | 98.592 | 97.218 |
| 10820.0 | 98.083 | 97.948 | 98.593 | 97.219 |
| 10830.0 | 98.084 | 97.949 | 98.594 | 97.22 |
| 10840.0 | 98.085 | 97.95 | 98.594 | 97.221 |
| 10850.0 | 98.086 | 97.95 | 98.595 | 97.222 |
| 10860.0 | 98.086 | 97.951 | 98.595 | 97.223 |
| 10870.0 | 98.087 | 97.952 | 98.596 | 97.224 |
| 10880.0 | 98.088 | 97.953 | 98.597 | 97.226 |
| 10890.0 | 98.089 | 97.954 | 98.597 | 97.227 |
| 10900.0 | 98.09 | 97.955 | 98.598 | 97.228 |
| 10910.0 | 98.09 | 97.956 | 98.598 | 97.229 |
| 10920.0 | 98.091 | 97.957 | 98.599 | 97.23 |
| 10930.0 | 98.092 | 97.958 | 98.6 | 97.231 |
| 10940.0 | 98.093 | 97.958 | 98.6 | 97.233 |
| 10950.0 | 98.094 | 97.959 | 98.601 | 97.234 |
| 10960.0 | 98.095 | 97.96 | 98.601 | 97.235 |
| 10970.0 | 98.095 | 97.961 | 98.602 | 97.236 |
| 10980.0 | 98.096 | 97.962 | 98.603 | 97.237 |
| 10990.0 | 98.097 | 97.963 | 98.603 | 97.238 |
| 11000.0 | 98.098 | 97.964 | 98.604 | 97.24 |
| 11010.0 | 98.099 | 97.964 | 98.604 | 97.241 |
| 11020.0 | 98.1 | 97.965 | 98.605 | 97.242 |
| 11030.0 | 98.1 | 97.966 | 98.606 | 97.243 |
| 11040.0 | 98.101 | 97.967 | 98.606 | 97.244 |
| 11050.0 | 98.102 | 97.968 | 98.607 | 97.245 |
| 11060.0 | 98.103 | 97.969 | 98.607 | 97.246 |
| 11070.0 | 98.104 | 97.97 | 98.608 | 97.248 |
| 11080.0 | 98.104 | 97.971 | 98.609 | 97.249 |
| 11090.0 | 98.105 | 97.971 | 98.609 | 97.25 |
| 11100.0 | 98.106 | 97.972 | 98.61 | 97.251 |
| 11110.0 | 98.107 | 97.973 | 98.61 | 97.252 |
| 11120.0 | 98.108 | 97.974 | 98.611 | 97.254 |
| 11130.0 | 98.108 | 97.975 | 98.612 | 97.255 |
| 11140.0 | 98.109 | 97.976 | 98.612 | 97.256 |
| 11150.0 | 98.11 | 97.977 | 98.613 | 97.257 |
| 11160.0 | 98.111 | 97.978 | 98.613 | 97.258 |
| 11170.0 | 98.112 | 97.978 | 98.614 | 97.259 |
| 11180.0 | 98.112 | 97.979 | 98.615 | 97.26 |
| 11190.0 | 98.113 | 97.98 | 98.615 | 97.262 |
| 11200.0 | 98.114 | 97.981 | 98.616 | 97.263 |
| 11210.0 | 98.115 | 97.982 | 98.616 | 97.264 |
| 11220.0 | 98.116 | 97.983 | 98.617 | 97.265 |
| 11230.0 | 98.117 | 97.984 | 98.618 | 97.266 |
| 11240.0 | 98.117 | 97.984 | 98.618 | 97.267 |
| 11250.0 | 98.118 | 97.985 | 98.619 | 97.268 |
| 11260.0 | 98.119 | 97.986 | 98.619 | 97.27 |
| 11270.0 | 98.12 | 97.987 | 98.62 | 97.271 |
| 11280.0 | 98.121 | 97.988 | 98.621 | 97.272 |
| 11290.0 | 98.122 | 97.989 | 98.621 | 97.273 |
| 11300.0 | 98.122 | 97.99 | 98.622 | 97.274 |
| 11310.0 | 98.123 | 97.991 | 98.622 | 97.276 |
| 11320.0 | 98.124 | 97.992 | 98.623 | 97.277 |
| 11330.0 | 98.125 | 97.992 | 98.624 | 97.278 |
| 11340.0 | 98.126 | 97.993 | 98.624 | 97.279 |
| 11350.0 | 98.126 | 97.994 | 98.625 | 97.28 |
| 11360.0 | 98.127 | 97.995 | 98.625 | 97.281 |
| 11370.0 | 98.128 | 97.996 | 98.626 | 97.282 |
| 11380.0 | 98.129 | 97.997 | 98.627 | 97.284 |
| 11390.0 | 98.13 | 97.998 | 98.627 | 97.285 |
| 11400.0 | 98.13 | 97.998 | 98.628 | 97.286 |
| 11410.0 | 98.131 | 97.999 | 98.628 | 97.287 |
| 11420.0 | 98.132 | 98 | 98.629 | 97.288 |
| 11430.0 | 98.133 | 98.001 | 98.63 | 97.289 |
| 11440.0 | 98.134 | 98.002 | 98.63 | 97.29 |
| 11450.0 | 98.134 | 98.003 | 98.631 | 97.292 |
| 11460.0 | 98.135 | 98.004 | 98.631 | 97.293 |
| 11470.0 | 98.136 | 98.004 | 98.632 | 97.294 |
| 11480.0 | 98.137 | 98.005 | 98.633 | 97.295 |
| 11490.0 | 98.138 | 98.006 | 98.633 | 97.296 |
| 11500.0 | 98.139 | 98.007 | 98.634 | 97.298 |
| 11510.0 | 98.139 | 98.008 | 98.634 | 97.299 |
| 11520.0 | 98.14 | 98.009 | 98.635 | 97.3 |
| 11530.0 | 98.141 | 98.01 | 98.636 | 97.301 |
| 11540.0 | 98.142 | 98.011 | 98.636 | 97.302 |
| 11550.0 | 98.143 | 98.011 | 98.637 | 97.303 |
| 11560.0 | 98.143 | 98.012 | 98.637 | 97.304 |
| 11570.0 | 98.144 | 98.013 | 98.638 | 97.306 |
| 11580.0 | 98.145 | 98.014 | 98.638 | 97.307 |
| 11590.0 | 98.146 | 98.015 | 98.639 | 97.308 |
| 11600.0 | 98.147 | 98.016 | 98.64 | 97.309 |
| 11610.0 | 98.148 | 98.017 | 98.64 | 97.31 |
| 11620.0 | 98.148 | 98.018 | 98.641 | 97.311 |
| 11630.0 | 98.149 | 98.018 | 98.642 | 97.312 |
| 11640.0 | 98.15 | 98.019 | 98.642 | 97.314 |
| 11650.0 | 98.151 | 98.02 | 98.643 | 97.315 |
| 11660.0 | 98.152 | 98.021 | 98.643 | 97.316 |
| 11670.0 | 98.152 | 98.022 | 98.644 | 97.317 |
| 11680.0 | 98.153 | 98.023 | 98.644 | 97.318 |
| 11690.0 | 98.154 | 98.024 | 98.645 | 97.319 |
| 11700.0 | 98.155 | 98.024 | 98.646 | 97.32 |
| 11710.0 | 98.156 | 98.025 | 98.646 | 97.322 |
| 11720.0 | 98.156 | 98.026 | 98.647 | 97.323 |
| 11730.0 | 98.157 | 98.027 | 98.648 | 97.324 |
| 11740.0 | 98.158 | 98.028 | 98.648 | 97.325 |
| 11750.0 | 98.159 | 98.029 | 98.649 | 97.326 |
| 11760.0 | 98.16 | 98.03 | 98.649 | 97.327 |
| 11770.0 | 98.16 | 98.03 | 98.65 | 97.328 |
| 11780.0 | 98.161 | 98.031 | 98.65 | 97.33 |
| 11790.0 | 98.162 | 98.032 | 98.651 | 97.331 |
| 11800.0 | 98.163 | 98.033 | 98.652 | 97.332 |
| 11810.0 | 98.164 | 98.034 | 98.652 | 97.333 |
| 11820.0 | 98.164 | 98.035 | 98.653 | 97.334 |
| 11830.0 | 98.165 | 98.036 | 98.653 | 97.335 |
| 11840.0 | 98.166 | 98.036 | 98.654 | 97.337 |
| 11850.0 | 98.167 | 98.037 | 98.655 | 97.338 |
| 11860.0 | 98.168 | 98.038 | 98.655 | 97.339 |
| 11870.0 | 98.168 | 98.039 | 98.656 | 97.34 |
| 11880.0 | 98.169 | 98.04 | 98.656 | 97.341 |
| 11890.0 | 98.17 | 98.041 | 98.657 | 97.342 |
| 11900.0 | 98.171 | 98.042 | 98.658 | 97.343 |
| 11910.0 | 98.172 | 98.042 | 98.658 | 97.345 |
| 11920.0 | 98.172 | 98.043 | 98.659 | 97.346 |
| 11930.0 | 98.173 | 98.044 | 98.659 | 97.347 |
| 11940.0 | 98.174 | 98.045 | 98.66 | 97.348 |
| 11950.0 | 98.175 | 98.046 | 98.66 | 97.349 |
| 11960.0 | 98.176 | 98.047 | 98.661 | 97.35 |
| 11970.0 | 98.176 | 98.048 | 98.662 | 97.352 |
| 11980.0 | 98.177 | 98.048 | 98.662 | 97.353 |
| 11990.0 | 98.178 | 98.049 | 98.663 | 97.354 |
| 12000.0 | 98.179 | 98.05 | 98.663 | 97.355 |
| 12010.0 | 98.179 | 98.05 | 98.663 | 97.354 |
| 12020.0 | 98.178 | 98.05 | 98.663 | 97.354 |
| 12030.0 | 98.178 | 98.049 | 98.663 | 97.354 |
| 12040.0 | 98.178 | 98.049 | 98.663 | 97.354 |
| 12050.0 | 98.178 | 98.049 | 98.663 | 97.353 |
| 12060.0 | 98.178 | 98.049 | 98.662 | 97.353 |
| 12070.0 | 98.177 | 98.048 | 98.662 | 97.352 |
| 12080.0 | 98.177 | 98.048 | 98.662 | 97.352 |
| 12090.0 | 98.177 | 98.048 | 98.662 | 97.352 |
| 12100.0 | 98.177 | 98.048 | 98.662 | 97.352 |
| 12110.0 | 98.176 | 98.048 | 98.662 | 97.351 |
| 12120.0 | 98.176 | 98.047 | 98.661 | 97.351 |
| 12130.0 | 98.176 | 98.047 | 98.661 | 97.35 |
| 12140.0 | 98.176 | 98.047 | 98.661 | 97.35 |
| 12150.0 | 98.175 | 98.046 | 98.661 | 97.35 |
| 12160.0 | 98.175 | 98.046 | 98.661 | 97.349 |
| 12170.0 | 98.175 | 98.046 | 98.66 | 97.349 |
| 12180.0 | 98.175 | 98.046 | 98.66 | 97.349 |
| 12190.0 | 98.174 | 98.045 | 98.66 | 97.348 |
| 12200.0 | 98.174 | 98.045 | 98.66 | 97.348 |
| 12210.0 | 98.174 | 98.045 | 98.66 | 97.348 |
| 12220.0 | 98.174 | 98.045 | 98.66 | 97.347 |
| 12230.0 | 98.174 | 98.044 | 98.66 | 97.347 |
| 12240.0 | 98.173 | 98.044 | 98.659 | 97.346 |
| 12250.0 | 98.173 | 98.044 | 98.659 | 97.346 |
| 12260.0 | 98.173 | 98.044 | 98.659 | 97.346 |
| 12270.0 | 98.172 | 98.043 | 98.659 | 97.345 |
| 12280.0 | 98.172 | 98.043 | 98.658 | 97.345 |
| 12290.0 | 98.172 | 98.043 | 98.658 | 97.345 |
| 12300.0 | 98.172 | 98.043 | 98.658 | 97.344 |
| 12310.0 | 98.172 | 98.042 | 98.658 | 97.344 |
| 12320.0 | 98.171 | 98.042 | 98.658 | 97.344 |
| 12330.0 | 98.171 | 98.042 | 98.658 | 97.343 |
| 12340.0 | 98.171 | 98.042 | 98.657 | 97.343 |
| 12350.0 | 98.17 | 98.041 | 98.657 | 97.342 |
| 12360.0 | 98.17 | 98.041 | 98.657 | 97.342 |
| 12370.0 | 98.17 | 98.041 | 98.657 | 97.342 |
| 12380.0 | 98.17 | 98.04 | 98.657 | 97.341 |
| 12390.0 | 98.17 | 98.04 | 98.656 | 97.341 |
| 12400.0 | 98.169 | 98.04 | 98.656 | 97.34 |
| 12410.0 | 98.169 | 98.04 | 98.656 | 97.34 |
| 12420.0 | 98.169 | 98.039 | 98.656 | 97.34 |
| 12430.0 | 98.168 | 98.039 | 98.656 | 97.339 |
| 12440.0 | 98.168 | 98.039 | 98.656 | 97.339 |
| 12450.0 | 98.168 | 98.038 | 98.655 | 97.338 |
| 12460.0 | 98.168 | 98.038 | 98.655 | 97.338 |
| 12470.0 | 98.167 | 98.038 | 98.655 | 97.338 |
| 12480.0 | 98.167 | 98.038 | 98.655 | 97.337 |
| 12490.0 | 98.167 | 98.037 | 98.654 | 97.337 |
| 12500.0 | 98.167 | 98.037 | 98.654 | 97.337 |
| 12510.0 | 98.166 | 98.037 | 98.654 | 97.336 |
| 12520.0 | 98.166 | 98.036 | 98.654 | 97.336 |
| 12530.0 | 98.166 | 98.036 | 98.654 | 97.335 |
| 12540.0 | 98.166 | 98.036 | 98.654 | 97.335 |
| 12550.0 | 98.165 | 98.036 | 98.653 | 97.334 |
| 12560.0 | 98.165 | 98.035 | 98.653 | 97.334 |
| 12570.0 | 98.165 | 98.035 | 98.653 | 97.334 |
| 12580.0 | 98.164 | 98.035 | 98.653 | 97.333 |
| 12590.0 | 98.164 | 98.034 | 98.652 | 97.333 |
| 12600.0 | 98.164 | 98.034 | 98.652 | 97.332 |
| 12610.0 | 98.164 | 98.034 | 98.652 | 97.332 |
| 12620.0 | 98.163 | 98.034 | 98.652 | 97.332 |
| 12630.0 | 98.163 | 98.033 | 98.652 | 97.331 |
| 12640.0 | 98.163 | 98.033 | 98.652 | 97.331 |
| 12650.0 | 98.162 | 98.033 | 98.651 | 97.33 |
| 12660.0 | 98.162 | 98.032 | 98.651 | 97.33 |
| 12670.0 | 98.162 | 98.032 | 98.651 | 97.33 |
| 12680.0 | 98.162 | 98.032 | 98.651 | 97.329 |
| 12690.0 | 98.161 | 98.031 | 98.65 | 97.329 |
| 12700.0 | 98.161 | 98.031 | 98.65 | 97.328 |
| 12710.0 | 98.161 | 98.031 | 98.65 | 97.328 |
| 12720.0 | 98.16 | 98.03 | 98.65 | 97.328 |
| 12730.0 | 98.16 | 98.03 | 98.65 | 97.327 |
| 12740.0 | 98.16 | 98.03 | 98.649 | 97.327 |
| 12750.0 | 98.16 | 98.03 | 98.649 | 97.326 |
| 12760.0 | 98.159 | 98.029 | 98.649 | 97.326 |
| 12770.0 | 98.159 | 98.029 | 98.649 | 97.325 |
| 12780.0 | 98.159 | 98.029 | 98.648 | 97.325 |
| 12790.0 | 98.158 | 98.028 | 98.648 | 97.324 |
| 12800.0 | 98.158 | 98.028 | 98.648 | 97.324 |
| 12810.0 | 98.158 | 98.028 | 98.648 | 97.324 |
| 12820.0 | 98.158 | 98.027 | 98.648 | 97.323 |
| 12830.0 | 98.157 | 98.027 | 98.648 | 97.323 |
| 12840.0 | 98.157 | 98.027 | 98.647 | 97.322 |
| 12850.0 | 98.157 | 98.026 | 98.647 | 97.322 |
| 12860.0 | 98.156 | 98.026 | 98.647 | 97.321 |
| 12870.0 | 98.156 | 98.026 | 98.647 | 97.321 |
| 12880.0 | 98.156 | 98.025 | 98.646 | 97.32 |
| 12890.0 | 98.156 | 98.025 | 98.646 | 97.32 |
| 12900.0 | 98.155 | 98.025 | 98.646 | 97.32 |
| 12910.0 | 98.155 | 98.024 | 98.646 | 97.319 |
| 12920.0 | 98.154 | 98.024 | 98.646 | 97.319 |
| 12930.0 | 98.154 | 98.024 | 98.645 | 97.318 |
| 12940.0 | 98.154 | 98.023 | 98.645 | 97.318 |
| 12950.0 | 98.154 | 98.023 | 98.645 | 97.317 |
| 12960.0 | 98.153 | 98.023 | 98.644 | 97.317 |
| 12970.0 | 98.153 | 98.022 | 98.644 | 97.316 |
| 12980.0 | 98.153 | 98.022 | 98.644 | 97.316 |
| 12990.0 | 98.152 | 98.022 | 98.644 | 97.316 |
| 13000.0 | 98.152 | 98.021 | 98.644 | 97.315 |
| 13010.0 | 98.152 | 98.021 | 98.643 | 97.315 |
| 13020.0 | 98.151 | 98.021 | 98.643 | 97.314 |
| 13030.0 | 98.151 | 98.02 | 98.643 | 97.314 |
| 13040.0 | 98.151 | 98.02 | 98.643 | 97.313 |
| 13050.0 | 98.15 | 98.02 | 98.642 | 97.313 |
| 13060.0 | 98.15 | 98.019 | 98.642 | 97.312 |
| 13070.0 | 98.15 | 98.019 | 98.642 | 97.312 |
| 13080.0 | 98.15 | 98.019 | 98.642 | 97.311 |
| 13090.0 | 98.149 | 98.018 | 98.642 | 97.311 |
| 13100.0 | 98.149 | 98.018 | 98.641 | 97.31 |
| 13110.0 | 98.149 | 98.018 | 98.641 | 97.31 |
| 13120.0 | 98.148 | 98.017 | 98.641 | 97.309 |
| 13130.0 | 98.148 | 98.017 | 98.641 | 97.309 |
| 13140.0 | 98.148 | 98.017 | 98.64 | 97.308 |
| 13150.0 | 98.147 | 98.016 | 98.64 | 97.308 |
| 13160.0 | 98.147 | 98.016 | 98.64 | 97.308 |
| 13170.0 | 98.147 | 98.016 | 98.64 | 97.307 |
| 13180.0 | 98.146 | 98.015 | 98.639 | 97.306 |
| 13190.0 | 98.146 | 98.015 | 98.639 | 97.306 |
| 13200.0 | 98.146 | 98.014 | 98.639 | 97.306 |
| 13210.0 | 98.145 | 98.014 | 98.639 | 97.305 |
| 13220.0 | 98.145 | 98.014 | 98.638 | 97.305 |
| 13230.0 | 98.145 | 98.014 | 98.638 | 97.304 |
| 13240.0 | 98.144 | 98.013 | 98.638 | 97.304 |
| 13250.0 | 98.144 | 98.013 | 98.638 | 97.303 |
| 13260.0 | 98.144 | 98.012 | 98.637 | 97.303 |
| 13270.0 | 98.143 | 98.012 | 98.637 | 97.302 |
| 13280.0 | 98.143 | 98.012 | 98.637 | 97.302 |
| 13290.0 | 98.143 | 98.011 | 98.637 | 97.301 |
| 13300.0 | 98.142 | 98.011 | 98.636 | 97.301 |
| 13310.0 | 98.142 | 98.011 | 98.636 | 97.3 |
| 13320.0 | 98.142 | 98.01 | 98.636 | 97.3 |
| 13330.0 | 98.141 | 98.01 | 98.636 | 97.299 |
| 13340.0 | 98.141 | 98.01 | 98.635 | 97.299 |
| 13350.0 | 98.141 | 98.009 | 98.635 | 97.298 |
| 13360.0 | 98.14 | 98.009 | 98.635 | 97.298 |
| 13370.0 | 98.14 | 98.008 | 98.635 | 97.297 |
| 13380.0 | 98.14 | 98.008 | 98.634 | 97.297 |
| 13390.0 | 98.139 | 98.008 | 98.634 | 97.296 |
| 13400.0 | 98.139 | 98.007 | 98.634 | 97.296 |
| 13410.0 | 98.138 | 98.007 | 98.634 | 97.295 |
| 13420.0 | 98.138 | 98.006 | 98.633 | 97.294 |
| 13430.0 | 98.138 | 98.006 | 98.633 | 97.294 |
| 13440.0 | 98.138 | 98.006 | 98.633 | 97.294 |
| 13450.0 | 98.137 | 98.005 | 98.633 | 97.293 |
| 13460.0 | 98.137 | 98.005 | 98.632 | 97.292 |
| 13470.0 | 98.136 | 98.005 | 98.632 | 97.292 |
| 13480.0 | 98.136 | 98.004 | 98.632 | 97.291 |
| 13490.0 | 98.136 | 98.004 | 98.632 | 97.291 |
| 13500.0 | 98.135 | 98.004 | 98.631 | 97.29 |
| 13510.0 | 98.135 | 98.003 | 98.631 | 97.29 |
| 13520.0 | 98.135 | 98.003 | 98.631 | 97.289 |
| 13530.0 | 98.134 | 98.002 | 98.63 | 97.289 |
| 13540.0 | 98.134 | 98.002 | 98.63 | 97.288 |
| 13550.0 | 98.134 | 98.002 | 98.63 | 97.288 |
| 13560.0 | 98.133 | 98.001 | 98.63 | 97.287 |
| 13570.0 | 98.133 | 98.001 | 98.629 | 97.287 |
| 13580.0 | 98.132 | 98 | 98.629 | 97.286 |
| 13590.0 | 98.132 | 98 | 98.629 | 97.286 |
| 13600.0 | 98.132 | 98 | 98.629 | 97.285 |
| 13610.0 | 98.131 | 97.999 | 98.628 | 97.285 |
| 13620.0 | 98.131 | 97.999 | 98.628 | 97.284 |
| 13630.0 | 98.131 | 97.998 | 98.628 | 97.284 |
| 13640.0 | 98.13 | 97.998 | 98.628 | 97.283 |
| 13650.0 | 98.13 | 97.998 | 98.627 | 97.282 |
| 13660.0 | 98.13 | 97.997 | 98.627 | 97.282 |
| 13670.0 | 98.129 | 97.997 | 98.627 | 97.281 |
| 13680.0 | 98.129 | 97.996 | 98.626 | 97.281 |
| 13690.0 | 98.128 | 97.996 | 98.626 | 97.28 |
| 13700.0 | 98.128 | 97.996 | 98.626 | 97.28 |
| 13710.0 | 98.128 | 97.995 | 98.626 | 97.279 |
| 13720.0 | 98.127 | 97.995 | 98.625 | 97.279 |
| 13730.0 | 98.127 | 97.994 | 98.625 | 97.278 |
| 13740.0 | 98.126 | 97.994 | 98.625 | 97.278 |
| 13750.0 | 98.126 | 97.994 | 98.624 | 97.277 |
| 13760.0 | 98.126 | 97.993 | 98.624 | 97.276 |
| 13770.0 | 98.125 | 97.993 | 98.624 | 97.276 |
| 13780.0 | 98.125 | 97.992 | 98.624 | 97.275 |
| 13790.0 | 98.125 | 97.992 | 98.623 | 97.275 |
| 13800.0 | 98.124 | 97.992 | 98.623 | 97.274 |
| 13810.0 | 98.124 | 97.991 | 98.623 | 97.274 |
| 13820.0 | 98.124 | 97.991 | 98.623 | 97.273 |
| 13830.0 | 98.123 | 97.99 | 98.622 | 97.272 |
| 13840.0 | 98.123 | 97.99 | 98.622 | 97.272 |
| 13850.0 | 98.122 | 97.99 | 98.622 | 97.271 |
| 13860.0 | 98.122 | 97.989 | 98.621 | 97.271 |
| 13870.0 | 98.122 | 97.989 | 98.621 | 97.27 |
| 13880.0 | 98.121 | 97.988 | 98.621 | 97.27 |
| 13890.0 | 98.121 | 97.988 | 98.621 | 97.269 |
| 13900.0 | 98.12 | 97.988 | 98.62 | 97.268 |
| 13910.0 | 98.12 | 97.987 | 98.62 | 97.268 |
| 13920.0 | 98.12 | 97.987 | 98.62 | 97.267 |
| 13930.0 | 98.119 | 97.986 | 98.619 | 97.267 |
| 13940.0 | 98.119 | 97.986 | 98.619 | 97.266 |
| 13950.0 | 98.118 | 97.985 | 98.619 | 97.266 |
| 13960.0 | 98.118 | 97.985 | 98.618 | 97.265 |
| 13970.0 | 98.118 | 97.985 | 98.618 | 97.264 |
| 13980.0 | 98.117 | 97.984 | 98.618 | 97.264 |
| 13990.0 | 98.117 | 97.984 | 98.618 | 97.263 |
| 14000.0 | 98.116 | 97.983 | 98.617 | 97.263 |
| 14010.0 | 98.116 | 97.983 | 98.617 | 97.262 |
| 14020.0 | 98.116 | 97.982 | 98.617 | 97.262 |
| 14030.0 | 98.115 | 97.982 | 98.616 | 97.261 |
| 14040.0 | 98.115 | 97.982 | 98.616 | 97.26 |
| 14050.0 | 98.114 | 97.981 | 98.616 | 97.26 |
| 14060.0 | 98.114 | 97.981 | 98.616 | 97.259 |
| 14070.0 | 98.114 | 97.98 | 98.615 | 97.259 |
| 14080.0 | 98.113 | 97.98 | 98.615 | 97.258 |
| 14090.0 | 98.113 | 97.979 | 98.615 | 97.257 |
| 14100.0 | 98.112 | 97.979 | 98.614 | 97.257 |
| 14110.0 | 98.112 | 97.978 | 98.614 | 97.256 |
| 14120.0 | 98.112 | 97.978 | 98.614 | 97.256 |
| 14130.0 | 98.111 | 97.978 | 98.614 | 97.255 |
| 14140.0 | 98.111 | 97.977 | 98.613 | 97.254 |
| 14150.0 | 98.11 | 97.977 | 98.613 | 97.254 |
| 14160.0 | 98.11 | 97.976 | 98.613 | 97.253 |
| 14170.0 | 98.11 | 97.976 | 98.612 | 97.253 |
| 14180.0 | 98.109 | 97.976 | 98.612 | 97.252 |
| 14190.0 | 98.109 | 97.975 | 98.612 | 97.251 |
| 14200.0 | 98.108 | 97.975 | 98.611 | 97.251 |
| 14210.0 | 98.108 | 97.974 | 98.611 | 97.25 |
| 14220.0 | 98.108 | 97.974 | 98.611 | 97.25 |
| 14230.0 | 98.107 | 97.973 | 98.61 | 97.249 |
| 14240.0 | 98.107 | 97.973 | 98.61 | 97.248 |
| 14250.0 | 98.106 | 97.972 | 98.61 | 97.248 |
| 14260.0 | 98.106 | 97.972 | 98.61 | 97.247 |
| 14270.0 | 98.105 | 97.972 | 98.609 | 97.246 |
| 14280.0 | 98.105 | 97.971 | 98.609 | 97.246 |
| 14290.0 | 98.105 | 97.97 | 98.609 | 97.245 |
| 14300.0 | 98.104 | 97.97 | 98.608 | 97.245 |
| 14310.0 | 98.104 | 97.97 | 98.608 | 97.244 |
| 14320.0 | 98.103 | 97.969 | 98.608 | 97.243 |
| 14330.0 | 98.103 | 97.969 | 98.607 | 97.243 |
| 14340.0 | 98.102 | 97.968 | 98.607 | 97.242 |
| 14350.0 | 98.102 | 97.968 | 98.607 | 97.242 |
| 14360.0 | 98.102 | 97.967 | 98.606 | 97.241 |
| 14370.0 | 98.101 | 97.967 | 98.606 | 97.24 |
| 14380.0 | 98.101 | 97.966 | 98.606 | 97.24 |
| 14390.0 | 98.1 | 97.966 | 98.606 | 97.239 |
| 14400.0 | 98.1 | 97.966 | 98.605 | 97.238 |
| 14410.0 | 98.1 | 97.965 | 98.605 | 97.238 |
| 14420.0 | 98.099 | 97.965 | 98.604 | 97.237 |
| 14430.0 | 98.099 | 97.964 | 98.604 | 97.237 |
| 14440.0 | 98.098 | 97.964 | 98.604 | 97.236 |
| 14450.0 | 98.098 | 97.963 | 98.604 | 97.235 |
| 14460.0 | 98.097 | 97.963 | 98.603 | 97.235 |
| 14470.0 | 98.097 | 97.962 | 98.603 | 97.234 |
| 14480.0 | 98.096 | 97.962 | 98.603 | 97.233 |
| 14490.0 | 98.096 | 97.961 | 98.602 | 97.233 |
| 14500.0 | 98.096 | 97.961 | 98.602 | 97.232 |
| 14510.0 | 98.095 | 97.96 | 98.602 | 97.232 |
| 14520.0 | 98.095 | 97.96 | 98.601 | 97.231 |
| 14530.0 | 98.094 | 97.96 | 98.601 | 97.23 |
| 14540.0 | 98.094 | 97.959 | 98.601 | 97.23 |
| 14550.0 | 98.093 | 97.958 | 98.6 | 97.229 |
| 14560.0 | 98.093 | 97.958 | 98.6 | 97.228 |
| 14570.0 | 98.092 | 97.958 | 98.6 | 97.228 |
| 14580.0 | 98.092 | 97.957 | 98.599 | 97.227 |
| 14590.0 | 98.092 | 97.957 | 98.599 | 97.226 |
| 14600.0 | 98.091 | 97.956 | 98.599 | 97.226 |
| 14610.0 | 98.091 | 97.956 | 98.598 | 97.225 |
| 14620.0 | 98.09 | 97.955 | 98.598 | 97.224 |
| 14630.0 | 98.09 | 97.955 | 98.598 | 97.224 |
| 14640.0 | 98.089 | 97.954 | 98.597 | 97.223 |
| 14650.0 | 98.089 | 97.954 | 98.597 | 97.222 |
| 14660.0 | 98.088 | 97.953 | 98.597 | 97.222 |
| 14670.0 | 98.088 | 97.953 | 98.596 | 97.221 |
| 14680.0 | 98.088 | 97.952 | 98.596 | 97.22 |
| 14690.0 | 98.087 | 97.952 | 98.596 | 97.22 |
| 14700.0 | 98.087 | 97.951 | 98.595 | 97.219 |
| 14710.0 | 98.086 | 97.951 | 98.595 | 97.218 |
| 14720.0 | 98.086 | 97.95 | 98.595 | 97.218 |
| 14730.0 | 98.085 | 97.95 | 98.594 | 97.217 |
| 14740.0 | 98.085 | 97.949 | 98.594 | 97.216 |
| 14750.0 | 98.084 | 97.949 | 98.594 | 97.216 |
| 14760.0 | 98.084 | 97.948 | 98.593 | 97.215 |
| 14770.0 | 98.083 | 97.948 | 98.593 | 97.214 |
| 14780.0 | 98.083 | 97.947 | 98.593 | 97.214 |
| 14790.0 | 98.082 | 97.947 | 98.592 | 97.213 |
| 14800.0 | 98.082 | 97.946 | 98.592 | 97.212 |
| 14810.0 | 98.082 | 97.946 | 98.592 | 97.212 |
| 14820.0 | 98.081 | 97.945 | 98.591 | 97.211 |
| 14830.0 | 98.081 | 97.945 | 98.591 | 97.21 |
| 14840.0 | 98.08 | 97.944 | 98.591 | 97.21 |
| 14850.0 | 98.08 | 97.944 | 98.59 | 97.209 |
| 14860.0 | 98.079 | 97.944 | 98.59 | 97.208 |
| 14870.0 | 98.079 | 97.943 | 98.59 | 97.208 |
| 14880.0 | 98.078 | 97.942 | 98.589 | 97.207 |
| 14890.0 | 98.078 | 97.942 | 98.589 | 97.206 |
| 14900.0 | 98.077 | 97.942 | 98.589 | 97.206 |
| 14910.0 | 98.077 | 97.941 | 98.588 | 97.205 |
| 14920.0 | 98.076 | 97.94 | 98.588 | 97.204 |
| 14930.0 | 98.076 | 97.94 | 98.588 | 97.204 |
| 14940.0 | 98.076 | 97.939 | 98.587 | 97.203 |
| 14950.0 | 98.075 | 97.939 | 98.587 | 97.202 |
| 14960.0 | 98.075 | 97.938 | 98.586 | 97.202 |
| 14970.0 | 98.074 | 97.938 | 98.586 | 97.201 |
| 14980.0 | 98.074 | 97.937 | 98.586 | 97.2 |
| 14990.0 | 98.073 | 97.937 | 98.585 | 97.199 |
| 15000.0 | 98.073 | 97.936 | 98.585 | 97.199 |
| 15010.0 | 98.072 | 97.936 | 98.585 | 97.198 |
| 15020.0 | 98.072 | 97.935 | 98.584 | 97.197 |
| 15030.0 | 98.071 | 97.935 | 98.584 | 97.197 |
| 15040.0 | 98.071 | 97.934 | 98.584 | 97.196 |
| 15050.0 | 98.07 | 97.934 | 98.583 | 97.195 |
| 15060.0 | 98.07 | 97.933 | 98.583 | 97.194 |
| 15070.0 | 98.069 | 97.933 | 98.583 | 97.194 |
| 15080.0 | 98.069 | 97.932 | 98.582 | 97.193 |
| 15090.0 | 98.068 | 97.932 | 98.582 | 97.192 |
| 15100.0 | 98.068 | 97.931 | 98.582 | 97.192 |
| 15110.0 | 98.067 | 97.931 | 98.581 | 97.191 |
| 15120.0 | 98.067 | 97.93 | 98.581 | 97.19 |
| 15130.0 | 98.066 | 97.93 | 98.58 | 97.19 |
| 15140.0 | 98.066 | 97.929 | 98.58 | 97.189 |
| 15150.0 | 98.066 | 97.929 | 98.58 | 97.188 |
| 15160.0 | 98.065 | 97.928 | 98.579 | 97.187 |
| 15170.0 | 98.064 | 97.928 | 98.579 | 97.187 |
| 15180.0 | 98.064 | 97.927 | 98.579 | 97.186 |
| 15190.0 | 98.064 | 97.927 | 98.578 | 97.185 |
| 15200.0 | 98.063 | 97.926 | 98.578 | 97.185 |
| 15210.0 | 98.062 | 97.926 | 98.578 | 97.184 |
| 15220.0 | 98.062 | 97.925 | 98.577 | 97.183 |
| 15230.0 | 98.062 | 97.924 | 98.577 | 97.182 |
| 15240.0 | 98.061 | 97.924 | 98.576 | 97.182 |
| 15250.0 | 98.06 | 97.923 | 98.576 | 97.181 |
| 15260.0 | 98.06 | 97.923 | 98.576 | 97.18 |
| 15270.0 | 98.06 | 97.922 | 98.575 | 97.18 |
| 15280.0 | 98.059 | 97.922 | 98.575 | 97.179 |
| 15290.0 | 98.059 | 97.921 | 98.575 | 97.178 |
| 15300.0 | 98.058 | 97.921 | 98.574 | 97.177 |
| 15310.0 | 98.058 | 97.92 | 98.574 | 97.177 |
| 15320.0 | 98.057 | 97.92 | 98.574 | 97.176 |
| 15330.0 | 98.057 | 97.919 | 98.573 | 97.175 |
| 15340.0 | 98.056 | 97.919 | 98.573 | 97.174 |
| 15350.0 | 98.056 | 97.918 | 98.572 | 97.174 |
| 15360.0 | 98.055 | 97.918 | 98.572 | 97.173 |
| 15370.0 | 98.055 | 97.917 | 98.572 | 97.172 |
| 15380.0 | 98.054 | 97.916 | 98.571 | 97.172 |
| 15390.0 | 98.054 | 97.916 | 98.571 | 97.171 |
| 15400.0 | 98.053 | 97.915 | 98.571 | 97.17 |
| 15410.0 | 98.052 | 97.915 | 98.57 | 97.169 |
| 15420.0 | 98.052 | 97.914 | 98.57 | 97.169 |
| 15430.0 | 98.052 | 97.914 | 98.57 | 97.168 |
| 15440.0 | 98.051 | 97.913 | 98.569 | 97.167 |
| 15450.0 | 98.05 | 97.913 | 98.569 | 97.166 |
| 15460.0 | 98.05 | 97.912 | 98.568 | 97.166 |
| 15470.0 | 98.05 | 97.912 | 98.568 | 97.165 |
| 15480.0 | 98.049 | 97.911 | 98.568 | 97.164 |
| 15490.0 | 98.048 | 97.91 | 98.567 | 97.163 |
| 15500.0 | 98.048 | 97.91 | 98.567 | 97.163 |
| 15510.0 | 98.047 | 97.909 | 98.566 | 97.162 |
| 15520.0 | 98.047 | 97.909 | 98.566 | 97.161 |
| 15530.0 | 98.046 | 97.908 | 98.566 | 97.16 |
| 15540.0 | 98.046 | 97.908 | 98.565 | 97.16 |
| 15550.0 | 98.045 | 97.907 | 98.565 | 97.159 |
| 15560.0 | 98.045 | 97.907 | 98.565 | 97.158 |
| 15570.0 | 98.044 | 97.906 | 98.564 | 97.157 |
| 15580.0 | 98.044 | 97.906 | 98.564 | 97.157 |
| 15590.0 | 98.043 | 97.905 | 98.563 | 97.156 |
| 15600.0 | 98.043 | 97.904 | 98.563 | 97.155 |
| 15610.0 | 98.042 | 97.904 | 98.563 | 97.154 |
| 15620.0 | 98.042 | 97.903 | 98.562 | 97.154 |
| 15630.0 | 98.041 | 97.903 | 98.562 | 97.153 |
| 15640.0 | 98.041 | 97.902 | 98.562 | 97.152 |
| 15650.0 | 98.04 | 97.902 | 98.561 | 97.151 |
| 15660.0 | 98.04 | 97.901 | 98.561 | 97.151 |
| 15670.0 | 98.039 | 97.9 | 98.56 | 97.15 |
| 15680.0 | 98.039 | 97.9 | 98.56 | 97.149 |
| 15690.0 | 98.038 | 97.899 | 98.56 | 97.148 |
| 15700.0 | 98.038 | 97.899 | 98.559 | 97.148 |
| 15710.0 | 98.037 | 97.898 | 98.559 | 97.147 |
| 15720.0 | 98.036 | 97.898 | 98.558 | 97.146 |
| 15730.0 | 98.036 | 97.897 | 98.558 | 97.145 |
| 15740.0 | 98.036 | 97.896 | 98.558 | 97.144 |
| 15750.0 | 98.035 | 97.896 | 98.557 | 97.144 |
| 15760.0 | 98.034 | 97.895 | 98.557 | 97.143 |
| 15770.0 | 98.034 | 97.895 | 98.556 | 97.142 |
| 15780.0 | 98.033 | 97.894 | 98.556 | 97.141 |
| 15790.0 | 98.033 | 97.894 | 98.556 | 97.141 |
| 15800.0 | 98.032 | 97.893 | 98.555 | 97.14 |
| 15810.0 | 98.032 | 97.893 | 98.555 | 97.139 |
| 15820.0 | 98.031 | 97.892 | 98.554 | 97.138 |
| 15830.0 | 98.031 | 97.891 | 98.554 | 97.138 |
| 15840.0 | 98.03 | 97.891 | 98.554 | 97.137 |
| 15850.0 | 98.03 | 97.89 | 98.553 | 97.136 |
| 15860.0 | 98.029 | 97.89 | 98.553 | 97.135 |
| 15870.0 | 98.028 | 97.889 | 98.552 | 97.134 |
| 15880.0 | 98.028 | 97.888 | 98.552 | 97.134 |
| 15890.0 | 98.028 | 97.888 | 98.552 | 97.133 |
| 15900.0 | 98.027 | 97.887 | 98.551 | 97.132 |
| 15910.0 | 98.026 | 97.887 | 98.551 | 97.131 |
| 15920.0 | 98.026 | 97.886 | 98.55 | 97.13 |
| 15930.0 | 98.025 | 97.886 | 98.55 | 97.13 |
| 15940.0 | 98.025 | 97.885 | 98.55 | 97.129 |
| 15950.0 | 98.024 | 97.884 | 98.549 | 97.128 |
| 15960.0 | 98.024 | 97.884 | 98.549 | 97.127 |
| 15970.0 | 98.023 | 97.883 | 98.548 | 97.126 |
| 15980.0 | 98.023 | 97.883 | 98.548 | 97.126 |
| 15990.0 | 98.022 | 97.882 | 98.548 | 97.125 |
| 16000.0 | 98.022 | 97.882 | 98.547 | 97.124 |
| 16010.0 | 98.021 | 97.881 | 98.547 | 97.123 |
| 16020.0 | 98.02 | 97.88 | 98.546 | 97.122 |
| 16030.0 | 98.02 | 97.88 | 98.546 | 97.122 |
| 16040.0 | 98.019 | 97.879 | 98.546 | 97.121 |
| 16050.0 | 98.019 | 97.879 | 98.545 | 97.12 |
| 16060.0 | 98.018 | 97.878 | 98.545 | 97.119 |
| 16070.0 | 98.018 | 97.878 | 98.544 | 97.118 |
| 16080.0 | 98.017 | 97.877 | 98.544 | 97.118 |
| 16090.0 | 98.016 | 97.876 | 98.544 | 97.117 |
| 16100.0 | 98.016 | 97.876 | 98.543 | 97.116 |
| 16110.0 | 98.015 | 97.875 | 98.543 | 97.115 |
| 16120.0 | 98.015 | 97.874 | 98.542 | 97.114 |
| 16130.0 | 98.014 | 97.874 | 98.542 | 97.114 |
| 16140.0 | 98.014 | 97.873 | 98.542 | 97.113 |
| 16150.0 | 98.013 | 97.873 | 98.541 | 97.112 |
| 16160.0 | 98.013 | 97.872 | 98.541 | 97.111 |
| 16170.0 | 98.012 | 97.872 | 98.54 | 97.11 |
| 16180.0 | 98.012 | 97.871 | 98.54 | 97.11 |
| 16190.0 | 98.011 | 97.87 | 98.54 | 97.109 |
| 16200.0 | 98.01 | 97.87 | 98.539 | 97.108 |
| 16210.0 | 98.01 | 97.869 | 98.539 | 97.107 |
| 16220.0 | 98.009 | 97.869 | 98.538 | 97.106 |
| 16230.0 | 98.009 | 97.868 | 98.538 | 97.106 |
| 16240.0 | 98.008 | 97.867 | 98.538 | 97.105 |
| 16250.0 | 98.008 | 97.867 | 98.537 | 97.104 |
| 16260.0 | 98.007 | 97.866 | 98.537 | 97.103 |
| 16270.0 | 98.006 | 97.866 | 98.536 | 97.102 |
| 16280.0 | 98.006 | 97.865 | 98.536 | 97.102 |
| 16290.0 | 98.005 | 97.864 | 98.535 | 97.101 |
| 16300.0 | 98.005 | 97.864 | 98.535 | 97.1 |
| 16310.0 | 98.004 | 97.863 | 98.535 | 97.099 |
| 16320.0 | 98.004 | 97.862 | 98.534 | 97.098 |
| 16330.0 | 98.003 | 97.862 | 98.534 | 97.097 |
| 16340.0 | 98.002 | 97.861 | 98.533 | 97.096 |
| 16350.0 | 98.002 | 97.861 | 98.533 | 97.096 |
| 16360.0 | 98.001 | 97.86 | 98.532 | 97.095 |
| 16370.0 | 98.001 | 97.86 | 98.532 | 97.094 |
| 16380.0 | 98 | 97.859 | 98.532 | 97.093 |
| 16390.0 | 98 | 97.858 | 98.531 | 97.092 |
| 16400.0 | 97.999 | 97.858 | 98.531 | 97.092 |
| 16410.0 | 97.998 | 97.857 | 98.53 | 97.091 |
| 16420.0 | 97.998 | 97.856 | 98.53 | 97.09 |
| 16430.0 | 97.997 | 97.856 | 98.53 | 97.089 |
| 16440.0 | 97.997 | 97.855 | 98.529 | 97.088 |
| 16450.0 | 97.996 | 97.855 | 98.529 | 97.087 |
| 16460.0 | 97.996 | 97.854 | 98.528 | 97.086 |
| 16470.0 | 97.995 | 97.853 | 98.528 | 97.086 |
| 16480.0 | 97.994 | 97.853 | 98.528 | 97.085 |
| 16490.0 | 97.994 | 97.852 | 98.527 | 97.084 |
| 16500.0 | 97.993 | 97.852 | 98.527 | 97.083 |
| 16510.0 | 97.993 | 97.851 | 98.526 | 97.082 |
| 16520.0 | 97.992 | 97.85 | 98.526 | 97.082 |
| 16530.0 | 97.992 | 97.85 | 98.525 | 97.081 |
| 16540.0 | 97.991 | 97.849 | 98.525 | 97.08 |
| 16550.0 | 97.99 | 97.848 | 98.524 | 97.079 |
| 16560.0 | 97.99 | 97.848 | 98.524 | 97.078 |
| 16570.0 | 97.989 | 97.847 | 98.524 | 97.077 |
| 16580.0 | 97.989 | 97.846 | 98.523 | 97.076 |
| 16590.0 | 97.988 | 97.846 | 98.523 | 97.076 |
| 16600.0 | 97.988 | 97.845 | 98.522 | 97.075 |
| 16610.0 | 97.987 | 97.845 | 98.522 | 97.074 |
| 16620.0 | 97.986 | 97.844 | 98.522 | 97.073 |
| 16630.0 | 97.986 | 97.843 | 98.521 | 97.072 |
| 16640.0 | 97.985 | 97.843 | 98.521 | 97.071 |
| 16650.0 | 97.985 | 97.842 | 98.52 | 97.07 |
| 16660.0 | 97.984 | 97.842 | 98.52 | 97.07 |
| 16670.0 | 97.984 | 97.841 | 98.519 | 97.069 |
| 16680.0 | 97.983 | 97.84 | 98.519 | 97.068 |
| 16690.0 | 97.982 | 97.84 | 98.518 | 97.067 |
| 16700.0 | 97.982 | 97.839 | 98.518 | 97.066 |
| 16710.0 | 97.981 | 97.838 | 98.518 | 97.065 |
| 16720.0 | 97.98 | 97.838 | 98.517 | 97.064 |
| 16730.0 | 97.98 | 97.837 | 98.517 | 97.064 |
| 16740.0 | 97.979 | 97.836 | 98.516 | 97.063 |
| 16750.0 | 97.979 | 97.836 | 98.516 | 97.062 |
| 16760.0 | 97.978 | 97.835 | 98.515 | 97.061 |
| 16770.0 | 97.978 | 97.835 | 98.515 | 97.06 |
| 16780.0 | 97.977 | 97.834 | 98.514 | 97.059 |
| 16790.0 | 97.976 | 97.833 | 98.514 | 97.058 |
| 16800.0 | 97.976 | 97.833 | 98.514 | 97.058 |
| 16810.0 | 97.975 | 97.832 | 98.513 | 97.057 |
| 16820.0 | 97.975 | 97.831 | 98.513 | 97.056 |
| 16830.0 | 97.974 | 97.831 | 98.512 | 97.055 |
| 16840.0 | 97.973 | 97.83 | 98.512 | 97.054 |
| 16850.0 | 97.973 | 97.83 | 98.511 | 97.053 |
| 16860.0 | 97.972 | 97.829 | 98.511 | 97.052 |
| 16870.0 | 97.972 | 97.828 | 98.51 | 97.052 |
| 16880.0 | 97.971 | 97.828 | 98.51 | 97.051 |
| 16890.0 | 97.97 | 97.827 | 98.51 | 97.05 |
| 16900.0 | 97.97 | 97.826 | 98.509 | 97.049 |
| 16910.0 | 97.969 | 97.826 | 98.509 | 97.048 |
| 16920.0 | 97.969 | 97.825 | 98.508 | 97.047 |
| 16930.0 | 97.968 | 97.824 | 98.508 | 97.046 |
| 16940.0 | 97.967 | 97.824 | 98.507 | 97.045 |
| 16950.0 | 97.967 | 97.823 | 98.507 | 97.044 |
| 16960.0 | 97.966 | 97.822 | 98.506 | 97.044 |
| 16970.0 | 97.966 | 97.822 | 98.506 | 97.043 |
| 16980.0 | 97.965 | 97.821 | 98.506 | 97.042 |
| 16990.0 | 97.964 | 97.82 | 98.505 | 97.041 |
| 17000.0 | 97.964 | 97.82 | 98.505 | 97.04 |
| 17010.0 | 97.963 | 97.819 | 98.504 | 97.039 |
| 17020.0 | 97.962 | 97.818 | 98.504 | 97.038 |
| 17030.0 | 97.962 | 97.818 | 98.503 | 97.037 |
| 17040.0 | 97.961 | 97.817 | 98.503 | 97.037 |
| 17050.0 | 97.961 | 97.816 | 98.502 | 97.036 |
| 17060.0 | 97.96 | 97.816 | 98.502 | 97.035 |
| 17070.0 | 97.96 | 97.815 | 98.502 | 97.034 |
| 17080.0 | 97.959 | 97.815 | 98.501 | 97.033 |
| 17090.0 | 97.958 | 97.814 | 98.501 | 97.032 |
| 17100.0 | 97.958 | 97.813 | 98.5 | 97.031 |
| 17110.0 | 97.957 | 97.813 | 98.5 | 97.03 |
| 17120.0 | 97.956 | 97.812 | 98.499 | 97.029 |
| 17130.0 | 97.956 | 97.811 | 98.499 | 97.028 |
| 17140.0 | 97.955 | 97.811 | 98.498 | 97.028 |
| 17150.0 | 97.955 | 97.81 | 98.498 | 97.027 |
| 17160.0 | 97.954 | 97.809 | 98.498 | 97.026 |
| 17170.0 | 97.953 | 97.809 | 98.497 | 97.025 |
| 17180.0 | 97.953 | 97.808 | 98.497 | 97.024 |
| 17190.0 | 97.952 | 97.807 | 98.496 | 97.023 |
| 17200.0 | 97.952 | 97.807 | 98.496 | 97.022 |
| 17210.0 | 97.951 | 97.806 | 98.495 | 97.021 |
| 17220.0 | 97.95 | 97.805 | 98.495 | 97.02 |
| 17230.0 | 97.95 | 97.805 | 98.494 | 97.02 |
| 17240.0 | 97.949 | 97.804 | 98.494 | 97.019 |
| 17250.0 | 97.948 | 97.803 | 98.493 | 97.018 |
| 17260.0 | 97.948 | 97.803 | 98.493 | 97.017 |
| 17270.0 | 97.947 | 97.802 | 98.492 | 97.016 |
| 17280.0 | 97.946 | 97.801 | 98.492 | 97.015 |
| 17290.0 | 97.946 | 97.801 | 98.492 | 97.014 |
| 17300.0 | 97.945 | 97.8 | 98.491 | 97.013 |
| 17310.0 | 97.945 | 97.799 | 98.491 | 97.012 |
| 17320.0 | 97.944 | 97.799 | 98.49 | 97.011 |
| 17330.0 | 97.943 | 97.798 | 98.49 | 97.01 |
| 17340.0 | 97.943 | 97.797 | 98.489 | 97.01 |
| 17350.0 | 97.942 | 97.797 | 98.489 | 97.009 |
| 17360.0 | 97.942 | 97.796 | 98.488 | 97.008 |
| 17370.0 | 97.941 | 97.795 | 98.488 | 97.007 |
| 17380.0 | 97.94 | 97.795 | 98.487 | 97.006 |
| 17390.0 | 97.94 | 97.794 | 98.487 | 97.005 |
| 17400.0 | 97.939 | 97.793 | 98.486 | 97.004 |
| 17410.0 | 97.938 | 97.793 | 98.486 | 97.003 |
| 17420.0 | 97.938 | 97.792 | 98.486 | 97.002 |
| 17430.0 | 97.937 | 97.791 | 98.485 | 97.001 |
| 17440.0 | 97.936 | 97.791 | 98.485 | 97 |
| 17450.0 | 97.936 | 97.79 | 98.484 | 97 |
| 17460.0 | 97.935 | 97.789 | 98.484 | 96.999 |
| 17470.0 | 97.935 | 97.789 | 98.483 | 96.998 |
| 17480.0 | 97.934 | 97.788 | 98.483 | 96.997 |
| 17490.0 | 97.933 | 97.787 | 98.482 | 96.996 |
| 17500.0 | 97.933 | 97.786 | 98.482 | 96.995 |
| 17510.0 | 97.932 | 97.786 | 98.481 | 96.994 |
| 17520.0 | 97.931 | 97.785 | 98.481 | 96.993 |
| 17530.0 | 97.931 | 97.784 | 98.48 | 96.992 |
| 17540.0 | 97.93 | 97.784 | 98.48 | 96.991 |
| 17550.0 | 97.93 | 97.783 | 98.48 | 96.99 |
| 17560.0 | 97.929 | 97.782 | 98.479 | 96.989 |
| 17570.0 | 97.928 | 97.782 | 98.479 | 96.988 |
| 17580.0 | 97.928 | 97.781 | 98.478 | 96.988 |
| 17590.0 | 97.927 | 97.78 | 98.478 | 96.987 |
| 17600.0 | 97.926 | 97.78 | 98.477 | 96.986 |
| 17610.0 | 97.926 | 97.779 | 98.477 | 96.985 |
| 17620.0 | 97.925 | 97.778 | 98.476 | 96.984 |
| 17630.0 | 97.924 | 97.778 | 98.476 | 96.983 |
| 17640.0 | 97.924 | 97.777 | 98.475 | 96.982 |
| 17650.0 | 97.923 | 97.776 | 98.475 | 96.981 |
| 17660.0 | 97.922 | 97.776 | 98.474 | 96.98 |
| 17670.0 | 97.922 | 97.775 | 98.474 | 96.979 |
| 17680.0 | 97.921 | 97.774 | 98.473 | 96.978 |
| 17690.0 | 97.92 | 97.774 | 98.473 | 96.977 |
| 17700.0 | 97.92 | 97.773 | 98.472 | 96.976 |
| 17710.0 | 97.919 | 97.772 | 98.472 | 96.975 |
| 17720.0 | 97.919 | 97.771 | 98.472 | 96.974 |
| 17730.0 | 97.918 | 97.771 | 98.471 | 96.974 |
| 17740.0 | 97.917 | 97.77 | 98.47 | 96.973 |
| 17750.0 | 97.917 | 97.769 | 98.47 | 96.972 |
| 17760.0 | 97.916 | 97.769 | 98.47 | 96.971 |
| 17770.0 | 97.915 | 97.768 | 98.469 | 96.97 |
| 17780.0 | 97.915 | 97.767 | 98.469 | 96.969 |
| 17790.0 | 97.914 | 97.767 | 98.468 | 96.968 |
| 17800.0 | 97.913 | 97.766 | 98.468 | 96.967 |
| 17810.0 | 97.913 | 97.765 | 98.467 | 96.966 |
| 17820.0 | 97.912 | 97.764 | 98.467 | 96.965 |
| 17830.0 | 97.911 | 97.764 | 98.466 | 96.964 |
| 17840.0 | 97.911 | 97.763 | 98.466 | 96.963 |
| 17850.0 | 97.91 | 97.762 | 98.465 | 96.962 |
| 17860.0 | 97.91 | 97.762 | 98.465 | 96.961 |
| 17870.0 | 97.909 | 97.761 | 98.464 | 96.96 |
| 17880.0 | 97.908 | 97.76 | 98.464 | 96.959 |
| 17890.0 | 97.908 | 97.76 | 98.463 | 96.958 |
| 17900.0 | 97.907 | 97.759 | 98.463 | 96.958 |
| 17910.0 | 97.906 | 97.758 | 98.462 | 96.956 |
| 17920.0 | 97.906 | 97.758 | 98.462 | 96.956 |
| 17930.0 | 97.905 | 97.757 | 98.461 | 96.955 |
| 17940.0 | 97.904 | 97.756 | 98.461 | 96.954 |
| 17950.0 | 97.904 | 97.755 | 98.46 | 96.953 |
| 17960.0 | 97.903 | 97.755 | 98.46 | 96.952 |
| 17970.0 | 97.902 | 97.754 | 98.459 | 96.951 |
| 17980.0 | 97.902 | 97.753 | 98.459 | 96.95 |
| 17990.0 | 97.901 | 97.753 | 98.458 | 96.949 |
| 18000.0 | 97.9 | 97.752 | 98.458 | 96.948 |
| 18010.0 | 97.9 | 97.751 | 98.458 | 96.947 |
| 18020.0 | 97.899 | 97.75 | 98.457 | 96.946 |
| 18030.0 | 97.898 | 97.75 | 98.456 | 96.945 |
| 18040.0 | 97.898 | 97.749 | 98.456 | 96.944 |
| 18050.0 | 97.897 | 97.748 | 98.456 | 96.943 |
| 18060.0 | 97.896 | 97.748 | 98.455 | 96.942 |
| 18070.0 | 97.896 | 97.747 | 98.454 | 96.941 |
| 18080.0 | 97.895 | 97.746 | 98.454 | 96.94 |
| 18090.0 | 97.894 | 97.746 | 98.454 | 96.939 |
| 18100.0 | 97.894 | 97.745 | 98.453 | 96.938 |
| 18110.0 | 97.893 | 97.744 | 98.453 | 96.937 |
| 18120.0 | 97.892 | 97.743 | 98.452 | 96.936 |
| 18130.0 | 97.892 | 97.743 | 98.452 | 96.935 |
| 18140.0 | 97.891 | 97.742 | 98.451 | 96.934 |
| 18150.0 | 97.89 | 97.741 | 98.451 | 96.934 |
| 18160.0 | 97.89 | 97.74 | 98.45 | 96.932 |
| 18170.0 | 97.889 | 97.74 | 98.45 | 96.932 |
| 18180.0 | 97.888 | 97.739 | 98.449 | 96.93 |
| 18190.0 | 97.888 | 97.738 | 98.449 | 96.93 |
| 18200.0 | 97.887 | 97.738 | 98.448 | 96.929 |
| 18210.0 | 97.886 | 97.737 | 98.448 | 96.928 |
| 18220.0 | 97.886 | 97.736 | 98.447 | 96.927 |
| 18230.0 | 97.885 | 97.736 | 98.447 | 96.926 |
| 18240.0 | 97.884 | 97.735 | 98.446 | 96.925 |
| 18250.0 | 97.884 | 97.734 | 98.446 | 96.924 |
| 18260.0 | 97.883 | 97.733 | 98.445 | 96.923 |
| 18270.0 | 97.882 | 97.733 | 98.445 | 96.922 |
| 18280.0 | 97.882 | 97.732 | 98.444 | 96.921 |
| 18290.0 | 97.881 | 97.731 | 98.444 | 96.92 |
| 18300.0 | 97.88 | 97.73 | 98.443 | 96.919 |
| 18310.0 | 97.88 | 97.73 | 98.443 | 96.918 |
| 18320.0 | 97.879 | 97.729 | 98.442 | 96.917 |
| 18330.0 | 97.878 | 97.728 | 98.442 | 96.916 |
| 18340.0 | 97.878 | 97.728 | 98.441 | 96.915 |
| 18350.0 | 97.877 | 97.727 | 98.441 | 96.914 |
| 18360.0 | 97.876 | 97.726 | 98.44 | 96.913 |
| 18370.0 | 97.876 | 97.725 | 98.44 | 96.912 |
| 18380.0 | 97.875 | 97.725 | 98.439 | 96.911 |
| 18390.0 | 97.874 | 97.724 | 98.439 | 96.91 |
| 18400.0 | 97.874 | 97.723 | 98.438 | 96.909 |
| 18410.0 | 97.873 | 97.722 | 98.438 | 96.908 |
| 18420.0 | 97.872 | 97.722 | 98.437 | 96.907 |
| 18430.0 | 97.871 | 97.721 | 98.437 | 96.906 |
| 18440.0 | 97.871 | 97.72 | 98.436 | 96.905 |
| 18450.0 | 97.87 | 97.72 | 98.436 | 96.904 |
| 18460.0 | 97.869 | 97.719 | 98.435 | 96.903 |
| 18470.0 | 97.869 | 97.718 | 98.435 | 96.902 |
| 18480.0 | 97.868 | 97.717 | 98.434 | 96.901 |
| 18490.0 | 97.867 | 97.717 | 98.434 | 96.9 |
| 18500.0 | 97.867 | 97.716 | 98.433 | 96.899 |
| 18510.0 | 97.866 | 97.715 | 98.433 | 96.898 |
| 18520.0 | 97.865 | 97.714 | 98.432 | 96.897 |
| 18530.0 | 97.865 | 97.714 | 98.432 | 96.896 |
| 18540.0 | 97.864 | 97.713 | 98.431 | 96.895 |
| 18550.0 | 97.863 | 97.712 | 98.431 | 96.894 |
| 18560.0 | 97.862 | 97.712 | 98.43 | 96.893 |
| 18570.0 | 97.862 | 97.711 | 98.43 | 96.892 |
| 18580.0 | 97.861 | 97.71 | 98.429 | 96.891 |
| 18590.0 | 97.86 | 97.709 | 98.429 | 96.89 |
| 18600.0 | 97.86 | 97.708 | 98.428 | 96.889 |
| 18610.0 | 97.859 | 97.708 | 98.428 | 96.888 |
| 18620.0 | 97.858 | 97.707 | 98.427 | 96.887 |
| 18630.0 | 97.858 | 97.706 | 98.427 | 96.886 |
| 18640.0 | 97.857 | 97.706 | 98.426 | 96.885 |
| 18650.0 | 97.856 | 97.705 | 98.426 | 96.884 |
| 18660.0 | 97.856 | 97.704 | 98.425 | 96.883 |
| 18670.0 | 97.855 | 97.703 | 98.424 | 96.882 |
| 18680.0 | 97.854 | 97.703 | 98.424 | 96.881 |
| 18690.0 | 97.854 | 97.702 | 98.424 | 96.88 |
| 18700.0 | 97.853 | 97.701 | 98.423 | 96.879 |
| 18710.0 | 97.852 | 97.7 | 98.422 | 96.878 |
| 18720.0 | 97.852 | 97.7 | 98.422 | 96.877 |
| 18730.0 | 97.851 | 97.699 | 98.422 | 96.876 |
| 18740.0 | 97.85 | 97.698 | 98.421 | 96.875 |
| 18750.0 | 97.849 | 97.697 | 98.42 | 96.874 |
| 18760.0 | 97.849 | 97.697 | 98.42 | 96.873 |
| 18770.0 | 97.848 | 97.696 | 98.419 | 96.872 |
| 18780.0 | 97.847 | 97.695 | 98.419 | 96.871 |
| 18790.0 | 97.847 | 97.694 | 98.418 | 96.87 |
| 18800.0 | 97.846 | 97.694 | 98.418 | 96.869 |
| 18810.0 | 97.845 | 97.693 | 98.417 | 96.868 |
| 18820.0 | 97.844 | 97.692 | 98.417 | 96.867 |
| 18830.0 | 97.844 | 97.692 | 98.416 | 96.866 |
| 18840.0 | 97.843 | 97.691 | 98.416 | 96.865 |
| 18850.0 | 97.842 | 97.69 | 98.415 | 96.864 |
| 18860.0 | 97.842 | 97.689 | 98.415 | 96.863 |
| 18870.0 | 97.841 | 97.688 | 98.414 | 96.862 |
| 18880.0 | 97.84 | 97.688 | 98.414 | 96.861 |
| 18890.0 | 97.84 | 97.687 | 98.413 | 96.86 |
| 18900.0 | 97.839 | 97.686 | 98.413 | 96.859 |
| 18910.0 | 97.838 | 97.686 | 98.412 | 96.858 |
| 18920.0 | 97.838 | 97.685 | 98.412 | 96.857 |
| 18930.0 | 97.837 | 97.684 | 98.411 | 96.856 |
| 18940.0 | 97.836 | 97.683 | 98.411 | 96.855 |
| 18950.0 | 97.835 | 97.682 | 98.41 | 96.854 |
| 18960.0 | 97.835 | 97.682 | 98.41 | 96.853 |
| 18970.0 | 97.834 | 97.681 | 98.409 | 96.852 |
| 18980.0 | 97.833 | 97.68 | 98.409 | 96.851 |
| 18990.0 | 97.833 | 97.679 | 98.408 | 96.85 |
| 19000.0 | 97.832 | 97.679 | 98.408 | 96.849 |
| 19010.0 | 97.831 | 97.678 | 98.407 | 96.848 |
| 19020.0 | 97.83 | 97.677 | 98.406 | 96.847 |
| 19030.0 | 97.83 | 97.676 | 98.406 | 96.846 |
| 19040.0 | 97.829 | 97.676 | 98.406 | 96.845 |
| 19050.0 | 97.828 | 97.675 | 98.405 | 96.844 |
| 19060.0 | 97.828 | 97.674 | 98.404 | 96.842 |
| 19070.0 | 97.827 | 97.673 | 98.404 | 96.842 |
| 19080.0 | 97.826 | 97.673 | 98.403 | 96.84 |
| 19090.0 | 97.826 | 97.672 | 98.403 | 96.84 |
| 19100.0 | 97.825 | 97.671 | 98.402 | 96.838 |
| 19110.0 | 97.824 | 97.67 | 98.402 | 96.837 |
| 19120.0 | 97.823 | 97.67 | 98.401 | 96.836 |
| 19130.0 | 97.823 | 97.669 | 98.401 | 96.835 |
| 19140.0 | 97.822 | 97.668 | 98.4 | 96.834 |
| 19150.0 | 97.821 | 97.667 | 98.4 | 96.833 |
| 19160.0 | 97.82 | 97.666 | 98.399 | 96.832 |
| 19170.0 | 97.82 | 97.666 | 98.399 | 96.831 |
| 19180.0 | 97.819 | 97.665 | 98.398 | 96.83 |
| 19190.0 | 97.818 | 97.664 | 98.398 | 96.829 |
| 19200.0 | 97.818 | 97.664 | 98.397 | 96.828 |
| 19210.0 | 97.817 | 97.663 | 98.396 | 96.827 |
| 19220.0 | 97.816 | 97.662 | 98.396 | 96.826 |
| 19230.0 | 97.816 | 97.661 | 98.396 | 96.825 |
| 19240.0 | 97.815 | 97.66 | 98.395 | 96.824 |
| 19250.0 | 97.814 | 97.66 | 98.394 | 96.823 |
| 19260.0 | 97.813 | 97.659 | 98.394 | 96.822 |
| 19270.0 | 97.813 | 97.658 | 98.393 | 96.821 |
| 19280.0 | 97.812 | 97.657 | 98.393 | 96.82 |
| 19290.0 | 97.811 | 97.657 | 98.392 | 96.819 |
| 19300.0 | 97.81 | 97.656 | 98.392 | 96.818 |
| 19310.0 | 97.81 | 97.655 | 98.391 | 96.817 |
| 19320.0 | 97.809 | 97.654 | 98.391 | 96.816 |
| 19330.0 | 97.808 | 97.654 | 98.39 | 96.815 |
| 19340.0 | 97.808 | 97.653 | 98.39 | 96.814 |
| 19350.0 | 97.807 | 97.652 | 98.389 | 96.812 |
| 19360.0 | 97.806 | 97.651 | 98.389 | 96.811 |
| 19370.0 | 97.806 | 97.65 | 98.388 | 96.81 |
| 19380.0 | 97.805 | 97.65 | 98.388 | 96.809 |
| 19390.0 | 97.804 | 97.649 | 98.387 | 96.808 |
| 19400.0 | 97.803 | 97.648 | 98.386 | 96.807 |
| 19410.0 | 97.803 | 97.647 | 98.386 | 96.806 |
| 19420.0 | 97.802 | 97.647 | 98.385 | 96.805 |
| 19430.0 | 97.801 | 97.646 | 98.385 | 96.804 |
| 19440.0 | 97.8 | 97.645 | 98.384 | 96.803 |
| 19450.0 | 97.8 | 97.644 | 98.384 | 96.802 |
| 19460.0 | 97.799 | 97.644 | 98.383 | 96.801 |
| 19470.0 | 97.798 | 97.643 | 98.383 | 96.8 |
| 19480.0 | 97.798 | 97.642 | 98.382 | 96.799 |
| 19490.0 | 97.797 | 97.641 | 98.382 | 96.798 |
| 19500.0 | 97.796 | 97.64 | 98.381 | 96.797 |
| 19510.0 | 97.795 | 97.64 | 98.381 | 96.796 |
| 19520.0 | 97.795 | 97.639 | 98.38 | 96.795 |
| 19530.0 | 97.794 | 97.638 | 98.38 | 96.794 |
| 19540.0 | 97.793 | 97.637 | 98.379 | 96.792 |
| 19550.0 | 97.792 | 97.636 | 98.378 | 96.792 |
| 19560.0 | 97.792 | 97.636 | 98.378 | 96.79 |
| 19570.0 | 97.791 | 97.635 | 98.377 | 96.789 |
| 19580.0 | 97.79 | 97.634 | 98.377 | 96.788 |
| 19590.0 | 97.79 | 97.633 | 98.376 | 96.787 |
| 19600.0 | 97.789 | 97.633 | 98.376 | 96.786 |
| 19610.0 | 97.788 | 97.632 | 98.375 | 96.785 |
| 19620.0 | 97.787 | 97.631 | 98.375 | 96.784 |
| 19630.0 | 97.787 | 97.63 | 98.374 | 96.783 |
| 19640.0 | 97.786 | 97.629 | 98.374 | 96.782 |
| 19650.0 | 97.785 | 97.629 | 98.373 | 96.781 |
| 19660.0 | 97.784 | 97.628 | 98.372 | 96.78 |
| 19670.0 | 97.784 | 97.627 | 98.372 | 96.779 |
| 19680.0 | 97.783 | 97.626 | 98.371 | 96.778 |
| 19690.0 | 97.782 | 97.626 | 98.371 | 96.777 |
| 19700.0 | 97.782 | 97.625 | 98.37 | 96.776 |
| 19710.0 | 97.781 | 97.624 | 98.37 | 96.774 |
| 19720.0 | 97.78 | 97.623 | 98.369 | 96.774 |
| 19730.0 | 97.779 | 97.622 | 98.369 | 96.772 |
| 19740.0 | 97.778 | 97.622 | 98.368 | 96.771 |
| 19750.0 | 97.778 | 97.621 | 98.368 | 96.77 |
| 19760.0 | 97.777 | 97.62 | 98.367 | 96.769 |
| 19770.0 | 97.776 | 97.619 | 98.367 | 96.768 |
| 19780.0 | 97.776 | 97.618 | 98.366 | 96.767 |
| 19790.0 | 97.775 | 97.618 | 98.366 | 96.766 |
| 19800.0 | 97.774 | 97.617 | 98.365 | 96.765 |
| 19810.0 | 97.773 | 97.616 | 98.364 | 96.764 |
| 19820.0 | 97.773 | 97.615 | 98.364 | 96.763 |
| 19830.0 | 97.772 | 97.614 | 98.363 | 96.762 |
| 19840.0 | 97.771 | 97.614 | 98.363 | 96.761 |
| 19850.0 | 97.77 | 97.613 | 98.362 | 96.76 |
| 19860.0 | 97.77 | 97.612 | 98.362 | 96.758 |
| 19870.0 | 97.769 | 97.611 | 98.361 | 96.757 |
| 19880.0 | 97.768 | 97.61 | 98.361 | 96.756 |
| 19890.0 | 97.767 | 97.61 | 98.36 | 96.755 |
| 19900.0 | 97.767 | 97.609 | 98.36 | 96.754 |
| 19910.0 | 97.766 | 97.608 | 98.359 | 96.753 |
| 19920.0 | 97.765 | 97.607 | 98.358 | 96.752 |
| 19930.0 | 97.764 | 97.607 | 98.358 | 96.751 |
| 19940.0 | 97.764 | 97.606 | 98.357 | 96.75 |
| 19950.0 | 97.763 | 97.605 | 98.357 | 96.749 |
| 19960.0 | 97.762 | 97.604 | 98.356 | 96.748 |
| 19970.0 | 97.762 | 97.603 | 98.356 | 96.747 |
| 19980.0 | 97.761 | 97.603 | 98.355 | 96.746 |
| 19990.0 | 97.76 | 97.602 | 98.355 | 96.744 |
| 20000.0 | 97.759 | 97.601 | 98.354 | 96.743 |